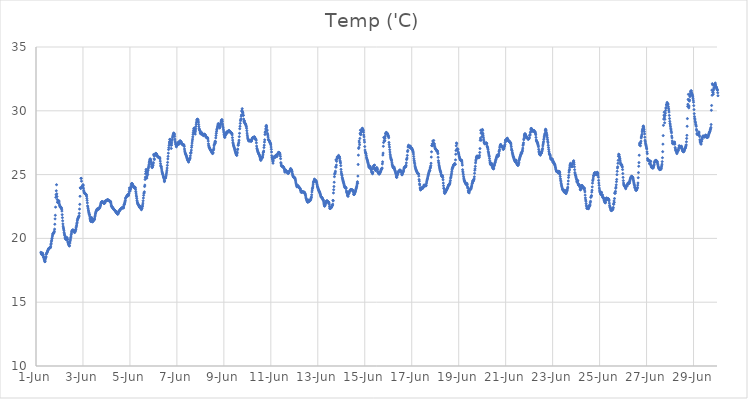
| Category | Temp ('C) |
|---|---|
| 44348.208333333336 | 18.914 |
| 44348.21875 | 18.857 |
| 44348.229166666664 | 18.812 |
| 44348.239583333336 | 18.775 |
| 44348.25 | 18.73 |
| 44348.260416666664 | 18.742 |
| 44348.270833333336 | 18.828 |
| 44348.28125 | 18.842 |
| 44348.291666666664 | 18.756 |
| 44348.302083333336 | 18.712 |
| 44348.3125 | 18.607 |
| 44348.322916666664 | 18.527 |
| 44348.333333333336 | 18.507 |
| 44348.34375 | 18.408 |
| 44348.354166666664 | 18.339 |
| 44348.364583333336 | 18.288 |
| 44348.375 | 18.174 |
| 44348.385416666664 | 18.178 |
| 44348.395833333336 | 18.319 |
| 44348.40625 | 18.461 |
| 44348.416666666664 | 18.495 |
| 44348.427083333336 | 18.569 |
| 44348.4375 | 18.751 |
| 44348.447916666664 | 18.816 |
| 44348.458333333336 | 18.848 |
| 44348.46875 | 18.884 |
| 44348.479166666664 | 18.934 |
| 44348.489583333336 | 18.974 |
| 44348.5 | 19.025 |
| 44348.510416666664 | 19.064 |
| 44348.520833333336 | 19.135 |
| 44348.53125 | 19.162 |
| 44348.541666666664 | 19.211 |
| 44348.552083333336 | 19.222 |
| 44348.5625 | 19.228 |
| 44348.572916666664 | 19.257 |
| 44348.583333333336 | 19.265 |
| 44348.59375 | 19.268 |
| 44348.604166666664 | 19.26 |
| 44348.614583333336 | 19.291 |
| 44348.625 | 19.383 |
| 44348.635416666664 | 19.526 |
| 44348.645833333336 | 19.617 |
| 44348.65625 | 19.76 |
| 44348.666666666664 | 19.853 |
| 44348.677083333336 | 19.973 |
| 44348.6875 | 20.032 |
| 44348.697916666664 | 20.175 |
| 44348.708333333336 | 20.274 |
| 44348.71875 | 20.362 |
| 44348.729166666664 | 20.379 |
| 44348.739583333336 | 20.404 |
| 44348.75 | 20.387 |
| 44348.760416666664 | 20.467 |
| 44348.770833333336 | 20.499 |
| 44348.78125 | 20.561 |
| 44348.791666666664 | 20.724 |
| 44348.802083333336 | 21.11 |
| 44348.8125 | 21.53 |
| 44348.822916666664 | 21.81 |
| 44348.833333333336 | 22.45 |
| 44348.84375 | 23.217 |
| 44348.854166666664 | 23.421 |
| 44348.864583333336 | 23.73 |
| 44348.875 | 24.207 |
| 44348.885416666664 | 23.493 |
| 44348.895833333336 | 23.282 |
| 44348.90625 | 23.049 |
| 44348.916666666664 | 22.842 |
| 44348.927083333336 | 22.81 |
| 44348.9375 | 22.842 |
| 44348.947916666664 | 22.965 |
| 44348.958333333336 | 22.901 |
| 44348.96875 | 22.956 |
| 44348.979166666664 | 22.909 |
| 44348.989583333336 | 22.767 |
| 44349.0 | 22.64 |
| 44349.010416666664 | 22.563 |
| 44349.020833333336 | 22.512 |
| 44349.03125 | 22.458 |
| 44349.041666666664 | 22.456 |
| 44349.052083333336 | 22.417 |
| 44349.0625 | 22.445 |
| 44349.072916666664 | 22.397 |
| 44349.083333333336 | 22.364 |
| 44349.09375 | 22.276 |
| 44349.104166666664 | 22.14 |
| 44349.114583333336 | 21.86 |
| 44349.125 | 21.625 |
| 44349.135416666664 | 21.379 |
| 44349.145833333336 | 21.136 |
| 44349.15625 | 20.956 |
| 44349.166666666664 | 20.826 |
| 44349.177083333336 | 20.735 |
| 44349.1875 | 20.634 |
| 44349.197916666664 | 20.474 |
| 44349.208333333336 | 20.361 |
| 44349.21875 | 20.265 |
| 44349.229166666664 | 20.213 |
| 44349.239583333336 | 20.091 |
| 44349.25 | 19.996 |
| 44349.260416666664 | 19.97 |
| 44349.270833333336 | 19.949 |
| 44349.28125 | 19.934 |
| 44349.291666666664 | 19.913 |
| 44349.302083333336 | 19.912 |
| 44349.3125 | 20.072 |
| 44349.322916666664 | 20.041 |
| 44349.333333333336 | 19.953 |
| 44349.34375 | 19.911 |
| 44349.354166666664 | 19.737 |
| 44349.364583333336 | 19.657 |
| 44349.375 | 19.634 |
| 44349.385416666664 | 19.499 |
| 44349.395833333336 | 19.56 |
| 44349.40625 | 19.66 |
| 44349.416666666664 | 19.405 |
| 44349.427083333336 | 19.429 |
| 44349.4375 | 19.612 |
| 44349.447916666664 | 19.724 |
| 44349.458333333336 | 19.83 |
| 44349.46875 | 19.947 |
| 44349.479166666664 | 20.072 |
| 44349.489583333336 | 20.18 |
| 44349.5 | 20.303 |
| 44349.510416666664 | 20.416 |
| 44349.520833333336 | 20.539 |
| 44349.53125 | 20.578 |
| 44349.541666666664 | 20.612 |
| 44349.552083333336 | 20.639 |
| 44349.5625 | 20.65 |
| 44349.572916666664 | 20.657 |
| 44349.583333333336 | 20.641 |
| 44349.59375 | 20.629 |
| 44349.604166666664 | 20.617 |
| 44349.614583333336 | 20.595 |
| 44349.625 | 20.545 |
| 44349.635416666664 | 20.486 |
| 44349.645833333336 | 20.458 |
| 44349.65625 | 20.502 |
| 44349.666666666664 | 20.534 |
| 44349.677083333336 | 20.589 |
| 44349.6875 | 20.667 |
| 44349.697916666664 | 20.721 |
| 44349.708333333336 | 20.835 |
| 44349.71875 | 20.934 |
| 44349.729166666664 | 21.031 |
| 44349.739583333336 | 21.151 |
| 44349.75 | 21.246 |
| 44349.760416666664 | 21.383 |
| 44349.770833333336 | 21.477 |
| 44349.78125 | 21.538 |
| 44349.791666666664 | 21.587 |
| 44349.802083333336 | 21.641 |
| 44349.8125 | 21.664 |
| 44349.822916666664 | 21.717 |
| 44349.833333333336 | 21.769 |
| 44349.84375 | 21.963 |
| 44349.854166666664 | 22.298 |
| 44349.864583333336 | 22.671 |
| 44349.875 | 23.301 |
| 44349.885416666664 | 23.962 |
| 44349.895833333336 | 23.961 |
| 44349.90625 | 23.913 |
| 44349.916666666664 | 24.708 |
| 44349.927083333336 | 24.707 |
| 44349.9375 | 24.484 |
| 44349.947916666664 | 23.98 |
| 44349.958333333336 | 24.076 |
| 44349.96875 | 24.02 |
| 44349.979166666664 | 24.098 |
| 44349.989583333336 | 24.077 |
| 44350.0 | 24.213 |
| 44350.010416666664 | 24.161 |
| 44350.020833333336 | 23.936 |
| 44350.03125 | 23.769 |
| 44350.041666666664 | 23.664 |
| 44350.052083333336 | 23.577 |
| 44350.0625 | 23.552 |
| 44350.072916666664 | 23.551 |
| 44350.083333333336 | 23.532 |
| 44350.09375 | 23.49 |
| 44350.104166666664 | 23.493 |
| 44350.114583333336 | 23.479 |
| 44350.125 | 23.452 |
| 44350.135416666664 | 23.439 |
| 44350.145833333336 | 23.396 |
| 44350.15625 | 23.298 |
| 44350.166666666664 | 23.138 |
| 44350.177083333336 | 22.979 |
| 44350.1875 | 22.784 |
| 44350.197916666664 | 22.551 |
| 44350.208333333336 | 22.465 |
| 44350.21875 | 22.351 |
| 44350.229166666664 | 22.223 |
| 44350.239583333336 | 22.137 |
| 44350.25 | 22.029 |
| 44350.260416666664 | 21.963 |
| 44350.270833333336 | 21.872 |
| 44350.28125 | 21.84 |
| 44350.291666666664 | 21.693 |
| 44350.302083333336 | 21.576 |
| 44350.3125 | 21.47 |
| 44350.322916666664 | 21.409 |
| 44350.333333333336 | 21.363 |
| 44350.34375 | 21.315 |
| 44350.354166666664 | 21.332 |
| 44350.364583333336 | 21.642 |
| 44350.375 | 21.569 |
| 44350.385416666664 | 21.501 |
| 44350.395833333336 | 21.434 |
| 44350.40625 | 21.295 |
| 44350.416666666664 | 21.333 |
| 44350.427083333336 | 21.433 |
| 44350.4375 | 21.362 |
| 44350.447916666664 | 21.452 |
| 44350.458333333336 | 21.464 |
| 44350.46875 | 21.453 |
| 44350.479166666664 | 21.453 |
| 44350.489583333336 | 21.493 |
| 44350.5 | 21.599 |
| 44350.510416666664 | 21.725 |
| 44350.520833333336 | 21.825 |
| 44350.53125 | 21.929 |
| 44350.541666666664 | 22.007 |
| 44350.552083333336 | 22.08 |
| 44350.5625 | 22.133 |
| 44350.572916666664 | 22.181 |
| 44350.583333333336 | 22.211 |
| 44350.59375 | 22.266 |
| 44350.604166666664 | 22.3 |
| 44350.614583333336 | 22.299 |
| 44350.625 | 22.316 |
| 44350.635416666664 | 22.315 |
| 44350.645833333336 | 22.298 |
| 44350.65625 | 22.278 |
| 44350.666666666664 | 22.321 |
| 44350.677083333336 | 22.31 |
| 44350.6875 | 22.353 |
| 44350.697916666664 | 22.388 |
| 44350.708333333336 | 22.408 |
| 44350.71875 | 22.44 |
| 44350.729166666664 | 22.502 |
| 44350.739583333336 | 22.557 |
| 44350.75 | 22.618 |
| 44350.760416666664 | 22.711 |
| 44350.770833333336 | 22.776 |
| 44350.78125 | 22.815 |
| 44350.791666666664 | 22.838 |
| 44350.802083333336 | 22.868 |
| 44350.8125 | 22.882 |
| 44350.822916666664 | 22.873 |
| 44350.833333333336 | 22.854 |
| 44350.84375 | 22.836 |
| 44350.854166666664 | 22.837 |
| 44350.864583333336 | 22.843 |
| 44350.875 | 22.775 |
| 44350.885416666664 | 22.778 |
| 44350.895833333336 | 22.745 |
| 44350.90625 | 22.738 |
| 44350.916666666664 | 22.779 |
| 44350.927083333336 | 22.759 |
| 44350.9375 | 22.916 |
| 44350.947916666664 | 22.902 |
| 44350.958333333336 | 22.915 |
| 44350.96875 | 22.889 |
| 44350.979166666664 | 22.948 |
| 44350.989583333336 | 22.958 |
| 44351.0 | 22.972 |
| 44351.010416666664 | 22.969 |
| 44351.020833333336 | 22.994 |
| 44351.03125 | 23.021 |
| 44351.041666666664 | 23.024 |
| 44351.052083333336 | 23.026 |
| 44351.0625 | 23.023 |
| 44351.072916666664 | 23.003 |
| 44351.083333333336 | 22.982 |
| 44351.09375 | 22.975 |
| 44351.104166666664 | 22.97 |
| 44351.114583333336 | 22.954 |
| 44351.125 | 22.938 |
| 44351.135416666664 | 22.928 |
| 44351.145833333336 | 22.872 |
| 44351.15625 | 22.885 |
| 44351.166666666664 | 22.906 |
| 44351.177083333336 | 22.879 |
| 44351.1875 | 22.783 |
| 44351.197916666664 | 22.694 |
| 44351.208333333336 | 22.592 |
| 44351.21875 | 22.52 |
| 44351.229166666664 | 22.481 |
| 44351.239583333336 | 22.456 |
| 44351.25 | 22.449 |
| 44351.260416666664 | 22.421 |
| 44351.270833333336 | 22.39 |
| 44351.28125 | 22.36 |
| 44351.291666666664 | 22.338 |
| 44351.302083333336 | 22.309 |
| 44351.3125 | 22.278 |
| 44351.322916666664 | 22.249 |
| 44351.333333333336 | 22.228 |
| 44351.34375 | 22.211 |
| 44351.354166666664 | 22.193 |
| 44351.364583333336 | 22.181 |
| 44351.375 | 22.166 |
| 44351.385416666664 | 22.149 |
| 44351.395833333336 | 22.099 |
| 44351.40625 | 22.044 |
| 44351.416666666664 | 22.018 |
| 44351.427083333336 | 22.104 |
| 44351.4375 | 21.997 |
| 44351.447916666664 | 22.013 |
| 44351.458333333336 | 21.929 |
| 44351.46875 | 21.913 |
| 44351.479166666664 | 21.911 |
| 44351.489583333336 | 21.9 |
| 44351.5 | 21.961 |
| 44351.510416666664 | 22.025 |
| 44351.520833333336 | 22.054 |
| 44351.53125 | 22.13 |
| 44351.541666666664 | 22.135 |
| 44351.552083333336 | 22.167 |
| 44351.5625 | 22.196 |
| 44351.572916666664 | 22.222 |
| 44351.583333333336 | 22.247 |
| 44351.59375 | 22.272 |
| 44351.604166666664 | 22.293 |
| 44351.614583333336 | 22.313 |
| 44351.625 | 22.321 |
| 44351.635416666664 | 22.354 |
| 44351.645833333336 | 22.359 |
| 44351.65625 | 22.379 |
| 44351.666666666664 | 22.404 |
| 44351.677083333336 | 22.403 |
| 44351.6875 | 22.391 |
| 44351.697916666664 | 22.411 |
| 44351.708333333336 | 22.419 |
| 44351.71875 | 22.421 |
| 44351.729166666664 | 22.38 |
| 44351.739583333336 | 22.543 |
| 44351.75 | 22.629 |
| 44351.760416666664 | 22.66 |
| 44351.770833333336 | 22.713 |
| 44351.78125 | 22.799 |
| 44351.791666666664 | 22.883 |
| 44351.802083333336 | 22.977 |
| 44351.8125 | 23.117 |
| 44351.822916666664 | 23.176 |
| 44351.833333333336 | 23.216 |
| 44351.84375 | 23.241 |
| 44351.854166666664 | 23.277 |
| 44351.864583333336 | 23.3 |
| 44351.875 | 23.316 |
| 44351.885416666664 | 23.366 |
| 44351.895833333336 | 23.411 |
| 44351.90625 | 23.432 |
| 44351.916666666664 | 23.408 |
| 44351.927083333336 | 23.421 |
| 44351.9375 | 23.352 |
| 44351.947916666664 | 23.399 |
| 44351.958333333336 | 23.525 |
| 44351.96875 | 23.669 |
| 44351.979166666664 | 23.959 |
| 44351.989583333336 | 23.835 |
| 44352.0 | 23.795 |
| 44352.010416666664 | 23.716 |
| 44352.020833333336 | 23.878 |
| 44352.03125 | 23.895 |
| 44352.041666666664 | 23.996 |
| 44352.052083333336 | 24.111 |
| 44352.0625 | 24.233 |
| 44352.072916666664 | 24.298 |
| 44352.083333333336 | 24.309 |
| 44352.09375 | 24.281 |
| 44352.104166666664 | 24.257 |
| 44352.114583333336 | 24.187 |
| 44352.125 | 24.181 |
| 44352.135416666664 | 24.126 |
| 44352.145833333336 | 24.081 |
| 44352.15625 | 24.032 |
| 44352.166666666664 | 24.012 |
| 44352.177083333336 | 24.027 |
| 44352.1875 | 23.97 |
| 44352.197916666664 | 23.997 |
| 44352.208333333336 | 24.019 |
| 44352.21875 | 24.004 |
| 44352.229166666664 | 23.956 |
| 44352.239583333336 | 23.841 |
| 44352.25 | 23.679 |
| 44352.260416666664 | 23.547 |
| 44352.270833333336 | 23.393 |
| 44352.28125 | 23.267 |
| 44352.291666666664 | 23.129 |
| 44352.302083333336 | 22.968 |
| 44352.3125 | 22.859 |
| 44352.322916666664 | 22.787 |
| 44352.333333333336 | 22.724 |
| 44352.34375 | 22.68 |
| 44352.354166666664 | 22.659 |
| 44352.364583333336 | 22.634 |
| 44352.375 | 22.592 |
| 44352.385416666664 | 22.542 |
| 44352.395833333336 | 22.489 |
| 44352.40625 | 22.456 |
| 44352.416666666664 | 22.431 |
| 44352.427083333336 | 22.415 |
| 44352.4375 | 22.481 |
| 44352.447916666664 | 22.505 |
| 44352.458333333336 | 22.443 |
| 44352.46875 | 22.404 |
| 44352.479166666664 | 22.291 |
| 44352.489583333336 | 22.246 |
| 44352.5 | 22.324 |
| 44352.510416666664 | 22.338 |
| 44352.520833333336 | 22.477 |
| 44352.53125 | 22.499 |
| 44352.541666666664 | 22.622 |
| 44352.552083333336 | 22.766 |
| 44352.5625 | 22.949 |
| 44352.572916666664 | 23.167 |
| 44352.583333333336 | 23.371 |
| 44352.59375 | 23.545 |
| 44352.604166666664 | 23.56 |
| 44352.614583333336 | 23.652 |
| 44352.625 | 24.066 |
| 44352.635416666664 | 24.178 |
| 44352.645833333336 | 24.621 |
| 44352.65625 | 24.797 |
| 44352.666666666664 | 25.065 |
| 44352.677083333336 | 25.246 |
| 44352.6875 | 25.405 |
| 44352.697916666664 | 25.207 |
| 44352.708333333336 | 24.795 |
| 44352.71875 | 24.719 |
| 44352.729166666664 | 24.89 |
| 44352.739583333336 | 25.048 |
| 44352.75 | 25.191 |
| 44352.760416666664 | 25.008 |
| 44352.770833333336 | 25.321 |
| 44352.78125 | 25.462 |
| 44352.791666666664 | 25.575 |
| 44352.802083333336 | 25.678 |
| 44352.8125 | 25.809 |
| 44352.822916666664 | 25.969 |
| 44352.833333333336 | 26.038 |
| 44352.84375 | 26.139 |
| 44352.854166666664 | 26.215 |
| 44352.864583333336 | 26.222 |
| 44352.875 | 26.193 |
| 44352.885416666664 | 26.122 |
| 44352.895833333336 | 26.019 |
| 44352.90625 | 25.901 |
| 44352.916666666664 | 25.777 |
| 44352.927083333336 | 25.64 |
| 44352.9375 | 25.595 |
| 44352.947916666664 | 25.546 |
| 44352.958333333336 | 25.592 |
| 44352.96875 | 25.723 |
| 44352.979166666664 | 25.704 |
| 44352.989583333336 | 25.842 |
| 44353.0 | 25.94 |
| 44353.010416666664 | 26.578 |
| 44353.020833333336 | 26.484 |
| 44353.03125 | 26.247 |
| 44353.041666666664 | 26.177 |
| 44353.052083333336 | 26.465 |
| 44353.0625 | 26.579 |
| 44353.072916666664 | 26.57 |
| 44353.083333333336 | 26.585 |
| 44353.09375 | 26.662 |
| 44353.104166666664 | 26.647 |
| 44353.114583333336 | 26.648 |
| 44353.125 | 26.625 |
| 44353.135416666664 | 26.595 |
| 44353.145833333336 | 26.549 |
| 44353.15625 | 26.496 |
| 44353.166666666664 | 26.441 |
| 44353.177083333336 | 26.407 |
| 44353.1875 | 26.402 |
| 44353.197916666664 | 26.394 |
| 44353.208333333336 | 26.372 |
| 44353.21875 | 26.344 |
| 44353.229166666664 | 26.352 |
| 44353.239583333336 | 26.352 |
| 44353.25 | 26.354 |
| 44353.260416666664 | 26.339 |
| 44353.270833333336 | 26.312 |
| 44353.28125 | 26.229 |
| 44353.291666666664 | 26.057 |
| 44353.302083333336 | 25.863 |
| 44353.3125 | 25.718 |
| 44353.322916666664 | 25.629 |
| 44353.333333333336 | 25.615 |
| 44353.34375 | 25.506 |
| 44353.354166666664 | 25.367 |
| 44353.364583333336 | 25.264 |
| 44353.375 | 25.18 |
| 44353.385416666664 | 25.095 |
| 44353.395833333336 | 25.027 |
| 44353.40625 | 24.976 |
| 44353.416666666664 | 24.893 |
| 44353.427083333336 | 24.818 |
| 44353.4375 | 24.768 |
| 44353.447916666664 | 24.702 |
| 44353.458333333336 | 24.578 |
| 44353.46875 | 24.448 |
| 44353.479166666664 | 24.509 |
| 44353.489583333336 | 24.748 |
| 44353.5 | 24.731 |
| 44353.510416666664 | 24.761 |
| 44353.520833333336 | 24.727 |
| 44353.53125 | 24.823 |
| 44353.541666666664 | 24.952 |
| 44353.552083333336 | 25.06 |
| 44353.5625 | 25.201 |
| 44353.572916666664 | 25.343 |
| 44353.583333333336 | 25.514 |
| 44353.59375 | 25.726 |
| 44353.604166666664 | 25.956 |
| 44353.614583333336 | 26.227 |
| 44353.625 | 26.429 |
| 44353.635416666664 | 26.68 |
| 44353.645833333336 | 26.963 |
| 44353.65625 | 27.117 |
| 44353.666666666664 | 27.298 |
| 44353.677083333336 | 27.472 |
| 44353.6875 | 27.579 |
| 44353.697916666664 | 27.764 |
| 44353.708333333336 | 27.756 |
| 44353.71875 | 27.704 |
| 44353.729166666664 | 27.524 |
| 44353.739583333336 | 27.38 |
| 44353.75 | 27.297 |
| 44353.760416666664 | 27.051 |
| 44353.770833333336 | 27.309 |
| 44353.78125 | 27.481 |
| 44353.791666666664 | 27.663 |
| 44353.802083333336 | 27.739 |
| 44353.8125 | 27.885 |
| 44353.822916666664 | 27.993 |
| 44353.833333333336 | 28.047 |
| 44353.84375 | 28.153 |
| 44353.854166666664 | 28.216 |
| 44353.864583333336 | 28.257 |
| 44353.875 | 28.246 |
| 44353.885416666664 | 28.211 |
| 44353.895833333336 | 28.13 |
| 44353.90625 | 27.993 |
| 44353.916666666664 | 27.781 |
| 44353.927083333336 | 27.62 |
| 44353.9375 | 27.504 |
| 44353.947916666664 | 27.393 |
| 44353.958333333336 | 27.348 |
| 44353.96875 | 27.242 |
| 44353.979166666664 | 27.172 |
| 44353.989583333336 | 27.308 |
| 44354.0 | 27.375 |
| 44354.010416666664 | 27.297 |
| 44354.020833333336 | 27.327 |
| 44354.03125 | 27.34 |
| 44354.041666666664 | 27.441 |
| 44354.052083333336 | 27.437 |
| 44354.0625 | 27.523 |
| 44354.072916666664 | 27.551 |
| 44354.083333333336 | 27.482 |
| 44354.09375 | 27.391 |
| 44354.104166666664 | 27.429 |
| 44354.114583333336 | 27.51 |
| 44354.125 | 27.606 |
| 44354.135416666664 | 27.657 |
| 44354.145833333336 | 27.626 |
| 44354.15625 | 27.582 |
| 44354.166666666664 | 27.589 |
| 44354.177083333336 | 27.583 |
| 44354.1875 | 27.513 |
| 44354.197916666664 | 27.47 |
| 44354.208333333336 | 27.415 |
| 44354.21875 | 27.394 |
| 44354.229166666664 | 27.378 |
| 44354.239583333336 | 27.371 |
| 44354.25 | 27.334 |
| 44354.260416666664 | 27.334 |
| 44354.270833333336 | 27.35 |
| 44354.28125 | 27.351 |
| 44354.291666666664 | 27.341 |
| 44354.302083333336 | 27.27 |
| 44354.3125 | 27.202 |
| 44354.322916666664 | 27.005 |
| 44354.333333333336 | 26.855 |
| 44354.34375 | 26.77 |
| 44354.354166666664 | 26.694 |
| 44354.364583333336 | 26.638 |
| 44354.375 | 26.61 |
| 44354.385416666664 | 26.559 |
| 44354.395833333336 | 26.498 |
| 44354.40625 | 26.445 |
| 44354.416666666664 | 26.381 |
| 44354.427083333336 | 26.315 |
| 44354.4375 | 26.262 |
| 44354.447916666664 | 26.196 |
| 44354.458333333336 | 26.146 |
| 44354.46875 | 26.103 |
| 44354.479166666664 | 26.098 |
| 44354.489583333336 | 26.029 |
| 44354.5 | 25.976 |
| 44354.510416666664 | 26.132 |
| 44354.520833333336 | 26.187 |
| 44354.53125 | 26.235 |
| 44354.541666666664 | 26.167 |
| 44354.552083333336 | 26.251 |
| 44354.5625 | 26.313 |
| 44354.572916666664 | 26.472 |
| 44354.583333333336 | 26.699 |
| 44354.59375 | 26.667 |
| 44354.604166666664 | 26.752 |
| 44354.614583333336 | 26.919 |
| 44354.625 | 27.135 |
| 44354.635416666664 | 27.283 |
| 44354.645833333336 | 27.472 |
| 44354.65625 | 27.635 |
| 44354.666666666664 | 27.781 |
| 44354.677083333336 | 27.956 |
| 44354.6875 | 28.15 |
| 44354.697916666664 | 28.3 |
| 44354.708333333336 | 28.442 |
| 44354.71875 | 28.578 |
| 44354.729166666664 | 28.602 |
| 44354.739583333336 | 28.659 |
| 44354.75 | 28.481 |
| 44354.760416666664 | 28.468 |
| 44354.770833333336 | 28.292 |
| 44354.78125 | 28.171 |
| 44354.791666666664 | 28.412 |
| 44354.802083333336 | 28.587 |
| 44354.8125 | 28.775 |
| 44354.822916666664 | 28.945 |
| 44354.833333333336 | 29.085 |
| 44354.84375 | 29.2 |
| 44354.854166666664 | 29.295 |
| 44354.864583333336 | 29.33 |
| 44354.875 | 29.341 |
| 44354.885416666664 | 29.317 |
| 44354.895833333336 | 29.296 |
| 44354.90625 | 29.207 |
| 44354.916666666664 | 29.11 |
| 44354.927083333336 | 28.932 |
| 44354.9375 | 28.766 |
| 44354.947916666664 | 28.613 |
| 44354.958333333336 | 28.531 |
| 44354.96875 | 28.477 |
| 44354.979166666664 | 28.437 |
| 44354.989583333336 | 28.331 |
| 44355.0 | 28.241 |
| 44355.010416666664 | 28.215 |
| 44355.020833333336 | 28.218 |
| 44355.03125 | 28.177 |
| 44355.041666666664 | 28.32 |
| 44355.052083333336 | 28.263 |
| 44355.0625 | 28.206 |
| 44355.072916666664 | 28.141 |
| 44355.083333333336 | 28.208 |
| 44355.09375 | 28.198 |
| 44355.104166666664 | 28.151 |
| 44355.114583333336 | 28.111 |
| 44355.125 | 28.053 |
| 44355.135416666664 | 28.098 |
| 44355.145833333336 | 28.103 |
| 44355.15625 | 28.172 |
| 44355.166666666664 | 28.167 |
| 44355.177083333336 | 28.138 |
| 44355.1875 | 28.134 |
| 44355.197916666664 | 28.122 |
| 44355.208333333336 | 28.106 |
| 44355.21875 | 28.048 |
| 44355.229166666664 | 28.02 |
| 44355.239583333336 | 27.955 |
| 44355.25 | 27.92 |
| 44355.260416666664 | 27.934 |
| 44355.270833333336 | 27.891 |
| 44355.28125 | 27.891 |
| 44355.291666666664 | 27.904 |
| 44355.302083333336 | 27.897 |
| 44355.3125 | 27.87 |
| 44355.322916666664 | 27.79 |
| 44355.333333333336 | 27.626 |
| 44355.34375 | 27.415 |
| 44355.354166666664 | 27.288 |
| 44355.364583333336 | 27.216 |
| 44355.375 | 27.129 |
| 44355.385416666664 | 27.109 |
| 44355.395833333336 | 27.074 |
| 44355.40625 | 27.014 |
| 44355.416666666664 | 26.975 |
| 44355.427083333336 | 26.93 |
| 44355.4375 | 26.911 |
| 44355.447916666664 | 26.884 |
| 44355.458333333336 | 26.857 |
| 44355.46875 | 26.815 |
| 44355.479166666664 | 26.785 |
| 44355.489583333336 | 26.742 |
| 44355.5 | 26.701 |
| 44355.510416666664 | 26.675 |
| 44355.520833333336 | 26.647 |
| 44355.53125 | 26.687 |
| 44355.541666666664 | 26.719 |
| 44355.552083333336 | 26.906 |
| 44355.5625 | 26.968 |
| 44355.572916666664 | 27.08 |
| 44355.583333333336 | 27.254 |
| 44355.59375 | 27.358 |
| 44355.604166666664 | 27.388 |
| 44355.614583333336 | 27.495 |
| 44355.625 | 27.611 |
| 44355.635416666664 | 27.465 |
| 44355.645833333336 | 27.583 |
| 44355.65625 | 27.874 |
| 44355.666666666664 | 28.059 |
| 44355.677083333336 | 28.229 |
| 44355.6875 | 28.37 |
| 44355.697916666664 | 28.506 |
| 44355.708333333336 | 28.574 |
| 44355.71875 | 28.64 |
| 44355.729166666664 | 28.739 |
| 44355.739583333336 | 28.819 |
| 44355.75 | 28.911 |
| 44355.760416666664 | 28.994 |
| 44355.770833333336 | 28.973 |
| 44355.78125 | 28.938 |
| 44355.791666666664 | 28.889 |
| 44355.802083333336 | 28.75 |
| 44355.8125 | 28.725 |
| 44355.822916666664 | 28.649 |
| 44355.833333333336 | 28.723 |
| 44355.84375 | 28.802 |
| 44355.854166666664 | 28.885 |
| 44355.864583333336 | 28.985 |
| 44355.875 | 29.105 |
| 44355.885416666664 | 29.193 |
| 44355.895833333336 | 29.246 |
| 44355.90625 | 29.285 |
| 44355.916666666664 | 29.302 |
| 44355.927083333336 | 29.274 |
| 44355.9375 | 29.152 |
| 44355.947916666664 | 28.962 |
| 44355.958333333336 | 28.802 |
| 44355.96875 | 28.678 |
| 44355.979166666664 | 28.551 |
| 44355.989583333336 | 28.419 |
| 44356.0 | 28.286 |
| 44356.010416666664 | 28.149 |
| 44356.020833333336 | 28.042 |
| 44356.03125 | 27.943 |
| 44356.041666666664 | 27.912 |
| 44356.052083333336 | 28.161 |
| 44356.0625 | 28.047 |
| 44356.072916666664 | 28.098 |
| 44356.083333333336 | 28.159 |
| 44356.09375 | 28.206 |
| 44356.104166666664 | 28.254 |
| 44356.114583333336 | 28.316 |
| 44356.125 | 28.343 |
| 44356.135416666664 | 28.259 |
| 44356.145833333336 | 28.271 |
| 44356.15625 | 28.341 |
| 44356.166666666664 | 28.365 |
| 44356.177083333336 | 28.406 |
| 44356.1875 | 28.408 |
| 44356.197916666664 | 28.421 |
| 44356.208333333336 | 28.405 |
| 44356.21875 | 28.441 |
| 44356.229166666664 | 28.439 |
| 44356.239583333336 | 28.424 |
| 44356.25 | 28.398 |
| 44356.260416666664 | 28.387 |
| 44356.270833333336 | 28.328 |
| 44356.28125 | 28.335 |
| 44356.291666666664 | 28.327 |
| 44356.302083333336 | 28.261 |
| 44356.3125 | 28.247 |
| 44356.322916666664 | 28.258 |
| 44356.333333333336 | 28.243 |
| 44356.34375 | 28.207 |
| 44356.354166666664 | 28.107 |
| 44356.364583333336 | 27.898 |
| 44356.375 | 27.7 |
| 44356.385416666664 | 27.526 |
| 44356.395833333336 | 27.42 |
| 44356.40625 | 27.324 |
| 44356.416666666664 | 27.251 |
| 44356.427083333336 | 27.225 |
| 44356.4375 | 27.139 |
| 44356.447916666664 | 27.079 |
| 44356.458333333336 | 27 |
| 44356.46875 | 26.927 |
| 44356.479166666664 | 26.863 |
| 44356.489583333336 | 26.803 |
| 44356.5 | 26.734 |
| 44356.510416666664 | 26.673 |
| 44356.520833333336 | 26.612 |
| 44356.53125 | 26.556 |
| 44356.541666666664 | 26.543 |
| 44356.552083333336 | 26.503 |
| 44356.5625 | 26.637 |
| 44356.572916666664 | 26.753 |
| 44356.583333333336 | 26.959 |
| 44356.59375 | 27.004 |
| 44356.604166666664 | 27.315 |
| 44356.614583333336 | 27.296 |
| 44356.625 | 27.429 |
| 44356.635416666664 | 27.54 |
| 44356.645833333336 | 27.693 |
| 44356.65625 | 27.973 |
| 44356.666666666664 | 28.235 |
| 44356.677083333336 | 28.592 |
| 44356.6875 | 28.784 |
| 44356.697916666664 | 29.011 |
| 44356.708333333336 | 29.224 |
| 44356.71875 | 29.307 |
| 44356.729166666664 | 29.369 |
| 44356.739583333336 | 29.569 |
| 44356.75 | 29.678 |
| 44356.760416666664 | 29.961 |
| 44356.770833333336 | 30.038 |
| 44356.78125 | 30.167 |
| 44356.791666666664 | 29.933 |
| 44356.802083333336 | 29.884 |
| 44356.8125 | 29.82 |
| 44356.822916666664 | 29.652 |
| 44356.833333333336 | 29.641 |
| 44356.84375 | 29.353 |
| 44356.854166666664 | 29.138 |
| 44356.864583333336 | 29.239 |
| 44356.875 | 29.197 |
| 44356.885416666664 | 29.076 |
| 44356.895833333336 | 29.029 |
| 44356.90625 | 28.989 |
| 44356.916666666664 | 28.977 |
| 44356.927083333336 | 28.932 |
| 44356.9375 | 28.877 |
| 44356.947916666664 | 28.813 |
| 44356.958333333336 | 28.748 |
| 44356.96875 | 28.621 |
| 44356.979166666664 | 28.44 |
| 44356.989583333336 | 28.246 |
| 44357.0 | 28.088 |
| 44357.010416666664 | 27.946 |
| 44357.020833333336 | 27.83 |
| 44357.03125 | 27.769 |
| 44357.041666666664 | 27.706 |
| 44357.052083333336 | 27.673 |
| 44357.0625 | 27.627 |
| 44357.072916666664 | 27.654 |
| 44357.083333333336 | 27.647 |
| 44357.09375 | 27.672 |
| 44357.104166666664 | 27.676 |
| 44357.114583333336 | 27.621 |
| 44357.125 | 27.671 |
| 44357.135416666664 | 27.638 |
| 44357.145833333336 | 27.678 |
| 44357.15625 | 27.667 |
| 44357.166666666664 | 27.609 |
| 44357.177083333336 | 27.632 |
| 44357.1875 | 27.718 |
| 44357.197916666664 | 27.789 |
| 44357.208333333336 | 27.844 |
| 44357.21875 | 27.887 |
| 44357.229166666664 | 27.841 |
| 44357.239583333336 | 27.91 |
| 44357.25 | 27.926 |
| 44357.260416666664 | 27.913 |
| 44357.270833333336 | 27.879 |
| 44357.28125 | 27.904 |
| 44357.291666666664 | 27.955 |
| 44357.302083333336 | 27.949 |
| 44357.3125 | 27.933 |
| 44357.322916666664 | 27.846 |
| 44357.333333333336 | 27.818 |
| 44357.34375 | 27.824 |
| 44357.354166666664 | 27.8 |
| 44357.364583333336 | 27.762 |
| 44357.375 | 27.682 |
| 44357.385416666664 | 27.487 |
| 44357.395833333336 | 27.235 |
| 44357.40625 | 27.063 |
| 44357.416666666664 | 27.001 |
| 44357.427083333336 | 26.93 |
| 44357.4375 | 26.856 |
| 44357.447916666664 | 26.79 |
| 44357.458333333336 | 26.734 |
| 44357.46875 | 26.692 |
| 44357.479166666664 | 26.651 |
| 44357.489583333336 | 26.609 |
| 44357.5 | 26.575 |
| 44357.510416666664 | 26.534 |
| 44357.520833333336 | 26.482 |
| 44357.53125 | 26.411 |
| 44357.541666666664 | 26.314 |
| 44357.552083333336 | 26.214 |
| 44357.5625 | 26.195 |
| 44357.572916666664 | 26.11 |
| 44357.583333333336 | 26.163 |
| 44357.59375 | 26.227 |
| 44357.604166666664 | 26.316 |
| 44357.614583333336 | 26.332 |
| 44357.625 | 26.29 |
| 44357.635416666664 | 26.331 |
| 44357.645833333336 | 26.363 |
| 44357.65625 | 26.47 |
| 44357.666666666664 | 26.598 |
| 44357.677083333336 | 26.736 |
| 44357.6875 | 26.773 |
| 44357.697916666664 | 26.851 |
| 44357.708333333336 | 27.121 |
| 44357.71875 | 27.307 |
| 44357.729166666664 | 27.55 |
| 44357.739583333336 | 27.724 |
| 44357.75 | 28.144 |
| 44357.760416666664 | 28.313 |
| 44357.770833333336 | 28.378 |
| 44357.78125 | 28.579 |
| 44357.791666666664 | 28.772 |
| 44357.802083333336 | 28.813 |
| 44357.8125 | 28.853 |
| 44357.822916666664 | 28.717 |
| 44357.833333333336 | 28.535 |
| 44357.84375 | 28.443 |
| 44357.854166666664 | 28.24 |
| 44357.864583333336 | 28.155 |
| 44357.875 | 28.041 |
| 44357.885416666664 | 27.932 |
| 44357.895833333336 | 27.768 |
| 44357.90625 | 27.726 |
| 44357.916666666664 | 27.681 |
| 44357.927083333336 | 27.667 |
| 44357.9375 | 27.642 |
| 44357.947916666664 | 27.588 |
| 44357.958333333336 | 27.538 |
| 44357.96875 | 27.499 |
| 44357.979166666664 | 27.451 |
| 44357.989583333336 | 27.405 |
| 44358.0 | 27.325 |
| 44358.010416666664 | 27.159 |
| 44358.020833333336 | 26.983 |
| 44358.03125 | 26.772 |
| 44358.041666666664 | 26.483 |
| 44358.052083333336 | 26.34 |
| 44358.0625 | 26.225 |
| 44358.072916666664 | 26.154 |
| 44358.083333333336 | 26.014 |
| 44358.09375 | 25.892 |
| 44358.104166666664 | 26.083 |
| 44358.114583333336 | 26.282 |
| 44358.125 | 26.38 |
| 44358.135416666664 | 26.321 |
| 44358.145833333336 | 26.328 |
| 44358.15625 | 26.303 |
| 44358.166666666664 | 26.407 |
| 44358.177083333336 | 26.398 |
| 44358.1875 | 26.388 |
| 44358.197916666664 | 26.476 |
| 44358.208333333336 | 26.475 |
| 44358.21875 | 26.523 |
| 44358.229166666664 | 26.521 |
| 44358.239583333336 | 26.491 |
| 44358.25 | 26.408 |
| 44358.260416666664 | 26.427 |
| 44358.270833333336 | 26.544 |
| 44358.28125 | 26.537 |
| 44358.291666666664 | 26.613 |
| 44358.302083333336 | 26.655 |
| 44358.3125 | 26.678 |
| 44358.322916666664 | 26.742 |
| 44358.333333333336 | 26.726 |
| 44358.34375 | 26.737 |
| 44358.354166666664 | 26.716 |
| 44358.364583333336 | 26.657 |
| 44358.375 | 26.694 |
| 44358.385416666664 | 26.68 |
| 44358.395833333336 | 26.552 |
| 44358.40625 | 26.428 |
| 44358.416666666664 | 26.246 |
| 44358.427083333336 | 25.94 |
| 44358.4375 | 25.841 |
| 44358.447916666664 | 25.732 |
| 44358.458333333336 | 25.688 |
| 44358.46875 | 25.665 |
| 44358.479166666664 | 25.645 |
| 44358.489583333336 | 25.637 |
| 44358.5 | 25.641 |
| 44358.510416666664 | 25.64 |
| 44358.520833333336 | 25.624 |
| 44358.53125 | 25.595 |
| 44358.541666666664 | 25.561 |
| 44358.552083333336 | 25.528 |
| 44358.5625 | 25.493 |
| 44358.572916666664 | 25.448 |
| 44358.583333333336 | 25.351 |
| 44358.59375 | 25.226 |
| 44358.604166666664 | 25.187 |
| 44358.614583333336 | 25.292 |
| 44358.625 | 25.339 |
| 44358.635416666664 | 25.355 |
| 44358.645833333336 | 25.312 |
| 44358.65625 | 25.275 |
| 44358.666666666664 | 25.244 |
| 44358.677083333336 | 25.239 |
| 44358.6875 | 25.222 |
| 44358.697916666664 | 25.163 |
| 44358.708333333336 | 25.182 |
| 44358.71875 | 25.164 |
| 44358.729166666664 | 25.109 |
| 44358.739583333336 | 25.087 |
| 44358.75 | 25.11 |
| 44358.760416666664 | 25.139 |
| 44358.770833333336 | 25.182 |
| 44358.78125 | 25.217 |
| 44358.791666666664 | 25.261 |
| 44358.802083333336 | 25.303 |
| 44358.8125 | 25.326 |
| 44358.822916666664 | 25.358 |
| 44358.833333333336 | 25.422 |
| 44358.84375 | 25.478 |
| 44358.854166666664 | 25.397 |
| 44358.864583333336 | 25.381 |
| 44358.875 | 25.395 |
| 44358.885416666664 | 25.36 |
| 44358.895833333336 | 25.286 |
| 44358.90625 | 25.224 |
| 44358.916666666664 | 25.105 |
| 44358.927083333336 | 24.994 |
| 44358.9375 | 24.922 |
| 44358.947916666664 | 24.882 |
| 44358.958333333336 | 24.834 |
| 44358.96875 | 24.792 |
| 44358.979166666664 | 24.786 |
| 44358.989583333336 | 24.783 |
| 44359.0 | 24.779 |
| 44359.010416666664 | 24.767 |
| 44359.020833333336 | 24.745 |
| 44359.03125 | 24.692 |
| 44359.041666666664 | 24.631 |
| 44359.052083333336 | 24.532 |
| 44359.0625 | 24.42 |
| 44359.072916666664 | 24.326 |
| 44359.083333333336 | 24.25 |
| 44359.09375 | 24.174 |
| 44359.104166666664 | 24.095 |
| 44359.114583333336 | 24.032 |
| 44359.125 | 24.109 |
| 44359.135416666664 | 24.068 |
| 44359.145833333336 | 24.155 |
| 44359.15625 | 24.109 |
| 44359.166666666664 | 24.089 |
| 44359.177083333336 | 24.035 |
| 44359.1875 | 24.032 |
| 44359.197916666664 | 24.027 |
| 44359.208333333336 | 24.001 |
| 44359.21875 | 23.948 |
| 44359.229166666664 | 23.933 |
| 44359.239583333336 | 23.918 |
| 44359.25 | 23.917 |
| 44359.260416666664 | 23.809 |
| 44359.270833333336 | 23.758 |
| 44359.28125 | 23.671 |
| 44359.291666666664 | 23.612 |
| 44359.302083333336 | 23.643 |
| 44359.3125 | 23.613 |
| 44359.322916666664 | 23.682 |
| 44359.333333333336 | 23.675 |
| 44359.34375 | 23.659 |
| 44359.354166666664 | 23.633 |
| 44359.364583333336 | 23.65 |
| 44359.375 | 23.631 |
| 44359.385416666664 | 23.631 |
| 44359.395833333336 | 23.632 |
| 44359.40625 | 23.595 |
| 44359.416666666664 | 23.611 |
| 44359.427083333336 | 23.624 |
| 44359.4375 | 23.596 |
| 44359.447916666664 | 23.54 |
| 44359.458333333336 | 23.511 |
| 44359.46875 | 23.442 |
| 44359.479166666664 | 23.362 |
| 44359.489583333336 | 23.245 |
| 44359.5 | 23.163 |
| 44359.510416666664 | 23.113 |
| 44359.520833333336 | 23.046 |
| 44359.53125 | 22.997 |
| 44359.541666666664 | 22.94 |
| 44359.552083333336 | 22.901 |
| 44359.5625 | 22.862 |
| 44359.572916666664 | 22.842 |
| 44359.583333333336 | 22.838 |
| 44359.59375 | 22.994 |
| 44359.604166666664 | 22.988 |
| 44359.614583333336 | 22.953 |
| 44359.625 | 22.91 |
| 44359.635416666664 | 22.915 |
| 44359.645833333336 | 22.927 |
| 44359.65625 | 22.94 |
| 44359.666666666664 | 22.948 |
| 44359.677083333336 | 22.977 |
| 44359.6875 | 23.028 |
| 44359.697916666664 | 23.073 |
| 44359.708333333336 | 23.104 |
| 44359.71875 | 23.187 |
| 44359.729166666664 | 23.25 |
| 44359.739583333336 | 23.416 |
| 44359.75 | 23.635 |
| 44359.760416666664 | 23.78 |
| 44359.770833333336 | 23.905 |
| 44359.78125 | 23.972 |
| 44359.791666666664 | 24.103 |
| 44359.802083333336 | 24.256 |
| 44359.8125 | 24.403 |
| 44359.822916666664 | 24.438 |
| 44359.833333333336 | 24.478 |
| 44359.84375 | 24.557 |
| 44359.854166666664 | 24.65 |
| 44359.864583333336 | 24.605 |
| 44359.875 | 24.59 |
| 44359.885416666664 | 24.563 |
| 44359.895833333336 | 24.507 |
| 44359.90625 | 24.52 |
| 44359.916666666664 | 24.536 |
| 44359.927083333336 | 24.509 |
| 44359.9375 | 24.443 |
| 44359.947916666664 | 24.39 |
| 44359.958333333336 | 24.333 |
| 44359.96875 | 24.222 |
| 44359.979166666664 | 24.112 |
| 44359.989583333336 | 24.05 |
| 44360.0 | 23.985 |
| 44360.010416666664 | 23.918 |
| 44360.020833333336 | 23.855 |
| 44360.03125 | 23.809 |
| 44360.041666666664 | 23.756 |
| 44360.052083333336 | 23.715 |
| 44360.0625 | 23.677 |
| 44360.072916666664 | 23.641 |
| 44360.083333333336 | 23.582 |
| 44360.09375 | 23.529 |
| 44360.104166666664 | 23.47 |
| 44360.114583333336 | 23.406 |
| 44360.125 | 23.326 |
| 44360.135416666664 | 23.252 |
| 44360.145833333336 | 23.248 |
| 44360.15625 | 23.223 |
| 44360.166666666664 | 23.22 |
| 44360.177083333336 | 23.207 |
| 44360.1875 | 23.153 |
| 44360.197916666664 | 23.125 |
| 44360.208333333336 | 23.095 |
| 44360.21875 | 23.035 |
| 44360.229166666664 | 23.007 |
| 44360.239583333336 | 22.977 |
| 44360.25 | 22.86 |
| 44360.260416666664 | 22.756 |
| 44360.270833333336 | 22.647 |
| 44360.28125 | 22.562 |
| 44360.291666666664 | 22.521 |
| 44360.302083333336 | 22.571 |
| 44360.3125 | 22.747 |
| 44360.322916666664 | 22.638 |
| 44360.333333333336 | 22.788 |
| 44360.34375 | 22.787 |
| 44360.354166666664 | 22.859 |
| 44360.364583333336 | 22.914 |
| 44360.375 | 22.925 |
| 44360.385416666664 | 22.937 |
| 44360.395833333336 | 22.936 |
| 44360.40625 | 22.922 |
| 44360.416666666664 | 22.918 |
| 44360.427083333336 | 22.858 |
| 44360.4375 | 22.829 |
| 44360.447916666664 | 22.833 |
| 44360.458333333336 | 22.841 |
| 44360.46875 | 22.826 |
| 44360.479166666664 | 22.759 |
| 44360.489583333336 | 22.662 |
| 44360.5 | 22.504 |
| 44360.510416666664 | 22.381 |
| 44360.520833333336 | 22.331 |
| 44360.53125 | 22.352 |
| 44360.541666666664 | 22.37 |
| 44360.552083333336 | 22.388 |
| 44360.5625 | 22.398 |
| 44360.572916666664 | 22.412 |
| 44360.583333333336 | 22.433 |
| 44360.59375 | 22.488 |
| 44360.604166666664 | 22.562 |
| 44360.614583333336 | 22.587 |
| 44360.625 | 22.587 |
| 44360.635416666664 | 22.683 |
| 44360.645833333336 | 22.983 |
| 44360.65625 | 22.946 |
| 44360.666666666664 | 23.561 |
| 44360.677083333336 | 23.814 |
| 44360.6875 | 24.067 |
| 44360.697916666664 | 24.402 |
| 44360.708333333336 | 24.837 |
| 44360.71875 | 25.032 |
| 44360.729166666664 | 25.087 |
| 44360.739583333336 | 25.143 |
| 44360.75 | 25.264 |
| 44360.760416666664 | 25.597 |
| 44360.770833333336 | 26.156 |
| 44360.78125 | 25.585 |
| 44360.791666666664 | 25.747 |
| 44360.802083333336 | 26.04 |
| 44360.8125 | 26.209 |
| 44360.822916666664 | 26.371 |
| 44360.833333333336 | 26.298 |
| 44360.84375 | 26.406 |
| 44360.854166666664 | 26.355 |
| 44360.864583333336 | 26.369 |
| 44360.875 | 26.369 |
| 44360.885416666664 | 26.508 |
| 44360.895833333336 | 26.432 |
| 44360.90625 | 26.426 |
| 44360.916666666664 | 26.385 |
| 44360.927083333336 | 26.374 |
| 44360.9375 | 26.243 |
| 44360.947916666664 | 26.09 |
| 44360.958333333336 | 25.996 |
| 44360.96875 | 25.905 |
| 44360.979166666664 | 25.702 |
| 44360.989583333336 | 25.407 |
| 44361.0 | 25.213 |
| 44361.010416666664 | 25.088 |
| 44361.020833333336 | 24.986 |
| 44361.03125 | 24.92 |
| 44361.041666666664 | 24.782 |
| 44361.052083333336 | 24.689 |
| 44361.0625 | 24.604 |
| 44361.072916666664 | 24.531 |
| 44361.083333333336 | 24.464 |
| 44361.09375 | 24.396 |
| 44361.104166666664 | 24.315 |
| 44361.114583333336 | 24.25 |
| 44361.125 | 24.167 |
| 44361.135416666664 | 24.09 |
| 44361.145833333336 | 24.028 |
| 44361.15625 | 23.995 |
| 44361.166666666664 | 23.955 |
| 44361.177083333336 | 24.013 |
| 44361.1875 | 24.006 |
| 44361.197916666664 | 23.911 |
| 44361.208333333336 | 23.952 |
| 44361.21875 | 23.721 |
| 44361.229166666664 | 23.619 |
| 44361.239583333336 | 23.631 |
| 44361.25 | 23.536 |
| 44361.260416666664 | 23.407 |
| 44361.270833333336 | 23.349 |
| 44361.28125 | 23.33 |
| 44361.291666666664 | 23.298 |
| 44361.302083333336 | 23.47 |
| 44361.3125 | 23.567 |
| 44361.322916666664 | 23.519 |
| 44361.333333333336 | 23.563 |
| 44361.34375 | 23.646 |
| 44361.354166666664 | 23.689 |
| 44361.364583333336 | 23.718 |
| 44361.375 | 23.761 |
| 44361.385416666664 | 23.805 |
| 44361.395833333336 | 23.818 |
| 44361.40625 | 23.83 |
| 44361.416666666664 | 23.819 |
| 44361.427083333336 | 23.816 |
| 44361.4375 | 23.819 |
| 44361.447916666664 | 23.823 |
| 44361.458333333336 | 23.813 |
| 44361.46875 | 23.769 |
| 44361.479166666664 | 23.759 |
| 44361.489583333336 | 23.763 |
| 44361.5 | 23.747 |
| 44361.510416666664 | 23.684 |
| 44361.520833333336 | 23.572 |
| 44361.53125 | 23.445 |
| 44361.541666666664 | 23.428 |
| 44361.552083333336 | 23.463 |
| 44361.5625 | 23.504 |
| 44361.572916666664 | 23.547 |
| 44361.583333333336 | 23.598 |
| 44361.59375 | 23.647 |
| 44361.604166666664 | 23.708 |
| 44361.614583333336 | 23.788 |
| 44361.625 | 23.856 |
| 44361.635416666664 | 23.928 |
| 44361.645833333336 | 23.991 |
| 44361.65625 | 24.083 |
| 44361.666666666664 | 24.183 |
| 44361.677083333336 | 24.333 |
| 44361.6875 | 24.441 |
| 44361.697916666664 | 24.312 |
| 44361.708333333336 | 24.884 |
| 44361.71875 | 25.793 |
| 44361.729166666664 | 26.524 |
| 44361.739583333336 | 27.048 |
| 44361.75 | 27.132 |
| 44361.760416666664 | 27.635 |
| 44361.770833333336 | 27.503 |
| 44361.78125 | 27.338 |
| 44361.791666666664 | 27.832 |
| 44361.802083333336 | 28.229 |
| 44361.8125 | 28.479 |
| 44361.822916666664 | 28.129 |
| 44361.833333333336 | 28.155 |
| 44361.84375 | 28.299 |
| 44361.854166666664 | 28.418 |
| 44361.864583333336 | 28.431 |
| 44361.875 | 28.479 |
| 44361.885416666664 | 28.584 |
| 44361.895833333336 | 28.63 |
| 44361.90625 | 28.613 |
| 44361.916666666664 | 28.534 |
| 44361.927083333336 | 28.438 |
| 44361.9375 | 28.478 |
| 44361.947916666664 | 28.319 |
| 44361.958333333336 | 28.104 |
| 44361.96875 | 27.955 |
| 44361.979166666664 | 27.716 |
| 44361.989583333336 | 27.546 |
| 44362.0 | 27.197 |
| 44362.010416666664 | 26.925 |
| 44362.020833333336 | 26.776 |
| 44362.03125 | 26.732 |
| 44362.041666666664 | 26.683 |
| 44362.052083333336 | 26.63 |
| 44362.0625 | 26.507 |
| 44362.072916666664 | 26.364 |
| 44362.083333333336 | 26.29 |
| 44362.09375 | 26.217 |
| 44362.104166666664 | 26.156 |
| 44362.114583333336 | 26.093 |
| 44362.125 | 26.001 |
| 44362.135416666664 | 25.946 |
| 44362.145833333336 | 25.864 |
| 44362.15625 | 25.775 |
| 44362.166666666664 | 25.68 |
| 44362.177083333336 | 25.611 |
| 44362.1875 | 25.553 |
| 44362.197916666664 | 25.568 |
| 44362.208333333336 | 25.595 |
| 44362.21875 | 25.665 |
| 44362.229166666664 | 25.634 |
| 44362.239583333336 | 25.57 |
| 44362.25 | 25.502 |
| 44362.260416666664 | 25.411 |
| 44362.270833333336 | 25.391 |
| 44362.28125 | 25.372 |
| 44362.291666666664 | 25.235 |
| 44362.302083333336 | 25.186 |
| 44362.3125 | 25.179 |
| 44362.322916666664 | 25.099 |
| 44362.333333333336 | 25.063 |
| 44362.34375 | 25.184 |
| 44362.354166666664 | 25.455 |
| 44362.364583333336 | 25.57 |
| 44362.375 | 25.637 |
| 44362.385416666664 | 25.699 |
| 44362.395833333336 | 25.705 |
| 44362.40625 | 25.718 |
| 44362.416666666664 | 25.743 |
| 44362.427083333336 | 25.49 |
| 44362.4375 | 25.439 |
| 44362.447916666664 | 25.445 |
| 44362.458333333336 | 25.319 |
| 44362.46875 | 25.328 |
| 44362.479166666664 | 25.399 |
| 44362.489583333336 | 25.463 |
| 44362.5 | 25.515 |
| 44362.510416666664 | 25.549 |
| 44362.520833333336 | 25.518 |
| 44362.53125 | 25.467 |
| 44362.541666666664 | 25.382 |
| 44362.552083333336 | 25.234 |
| 44362.5625 | 25.164 |
| 44362.572916666664 | 25.161 |
| 44362.583333333336 | 25.134 |
| 44362.59375 | 25.078 |
| 44362.604166666664 | 25.049 |
| 44362.614583333336 | 25.052 |
| 44362.625 | 25.061 |
| 44362.635416666664 | 25.11 |
| 44362.645833333336 | 25.122 |
| 44362.65625 | 25.173 |
| 44362.666666666664 | 25.216 |
| 44362.677083333336 | 25.269 |
| 44362.6875 | 25.302 |
| 44362.697916666664 | 25.383 |
| 44362.708333333336 | 25.427 |
| 44362.71875 | 25.43 |
| 44362.729166666664 | 25.482 |
| 44362.739583333336 | 25.519 |
| 44362.75 | 25.838 |
| 44362.760416666664 | 26.001 |
| 44362.770833333336 | 26.532 |
| 44362.78125 | 26.685 |
| 44362.791666666664 | 27.219 |
| 44362.802083333336 | 27.517 |
| 44362.8125 | 27.917 |
| 44362.822916666664 | 27.885 |
| 44362.833333333336 | 27.683 |
| 44362.84375 | 27.648 |
| 44362.854166666664 | 27.657 |
| 44362.864583333336 | 27.854 |
| 44362.875 | 28.017 |
| 44362.885416666664 | 28.199 |
| 44362.895833333336 | 28.208 |
| 44362.90625 | 28.278 |
| 44362.916666666664 | 28.308 |
| 44362.927083333336 | 28.254 |
| 44362.9375 | 28.263 |
| 44362.947916666664 | 28.225 |
| 44362.958333333336 | 28.239 |
| 44362.96875 | 28.198 |
| 44362.979166666664 | 28.137 |
| 44362.989583333336 | 28.082 |
| 44363.0 | 28.045 |
| 44363.010416666664 | 27.984 |
| 44363.020833333336 | 27.886 |
| 44363.03125 | 27.517 |
| 44363.041666666664 | 27.345 |
| 44363.052083333336 | 27.16 |
| 44363.0625 | 26.953 |
| 44363.072916666664 | 26.769 |
| 44363.083333333336 | 26.592 |
| 44363.09375 | 26.454 |
| 44363.104166666664 | 26.332 |
| 44363.114583333336 | 26.254 |
| 44363.125 | 26.193 |
| 44363.135416666664 | 26.151 |
| 44363.145833333336 | 26.074 |
| 44363.15625 | 25.925 |
| 44363.166666666664 | 25.819 |
| 44363.177083333336 | 25.73 |
| 44363.1875 | 25.666 |
| 44363.197916666664 | 25.604 |
| 44363.208333333336 | 25.56 |
| 44363.21875 | 25.526 |
| 44363.229166666664 | 25.523 |
| 44363.239583333336 | 25.546 |
| 44363.25 | 25.594 |
| 44363.260416666664 | 25.486 |
| 44363.270833333336 | 25.423 |
| 44363.28125 | 25.353 |
| 44363.291666666664 | 25.296 |
| 44363.302083333336 | 25.248 |
| 44363.3125 | 25.163 |
| 44363.322916666664 | 25.083 |
| 44363.333333333336 | 24.979 |
| 44363.34375 | 24.819 |
| 44363.354166666664 | 24.782 |
| 44363.364583333336 | 24.788 |
| 44363.375 | 24.896 |
| 44363.385416666664 | 24.966 |
| 44363.395833333336 | 25.014 |
| 44363.40625 | 25.087 |
| 44363.416666666664 | 25.153 |
| 44363.427083333336 | 25.203 |
| 44363.4375 | 25.241 |
| 44363.447916666664 | 25.249 |
| 44363.458333333336 | 25.267 |
| 44363.46875 | 25.303 |
| 44363.479166666664 | 25.31 |
| 44363.489583333336 | 25.342 |
| 44363.5 | 25.369 |
| 44363.510416666664 | 25.332 |
| 44363.520833333336 | 25.283 |
| 44363.53125 | 25.276 |
| 44363.541666666664 | 25.276 |
| 44363.552083333336 | 25.262 |
| 44363.5625 | 25.189 |
| 44363.572916666664 | 25.057 |
| 44363.583333333336 | 24.981 |
| 44363.59375 | 24.992 |
| 44363.604166666664 | 25.086 |
| 44363.614583333336 | 25.139 |
| 44363.625 | 25.2 |
| 44363.635416666664 | 25.206 |
| 44363.645833333336 | 25.261 |
| 44363.65625 | 25.355 |
| 44363.666666666664 | 25.449 |
| 44363.677083333336 | 25.524 |
| 44363.6875 | 25.56 |
| 44363.697916666664 | 25.578 |
| 44363.708333333336 | 25.586 |
| 44363.71875 | 25.589 |
| 44363.729166666664 | 25.624 |
| 44363.739583333336 | 25.673 |
| 44363.75 | 25.613 |
| 44363.760416666664 | 25.728 |
| 44363.770833333336 | 25.918 |
| 44363.78125 | 26.177 |
| 44363.791666666664 | 26.225 |
| 44363.802083333336 | 26.3 |
| 44363.8125 | 26.504 |
| 44363.822916666664 | 26.8 |
| 44363.833333333336 | 26.894 |
| 44363.84375 | 27.162 |
| 44363.854166666664 | 27.227 |
| 44363.864583333336 | 27.308 |
| 44363.875 | 27.204 |
| 44363.885416666664 | 27.167 |
| 44363.895833333336 | 27.187 |
| 44363.90625 | 27.188 |
| 44363.916666666664 | 27.121 |
| 44363.927083333336 | 27.242 |
| 44363.9375 | 27.179 |
| 44363.947916666664 | 27.213 |
| 44363.958333333336 | 27.131 |
| 44363.96875 | 27.065 |
| 44363.979166666664 | 27.043 |
| 44363.989583333336 | 27.066 |
| 44364.0 | 27.07 |
| 44364.010416666664 | 27.061 |
| 44364.020833333336 | 26.964 |
| 44364.03125 | 26.931 |
| 44364.041666666664 | 26.886 |
| 44364.052083333336 | 26.812 |
| 44364.0625 | 26.747 |
| 44364.072916666664 | 26.609 |
| 44364.083333333336 | 26.424 |
| 44364.09375 | 26.242 |
| 44364.104166666664 | 26.105 |
| 44364.114583333336 | 25.98 |
| 44364.125 | 25.873 |
| 44364.135416666664 | 25.748 |
| 44364.145833333336 | 25.638 |
| 44364.15625 | 25.547 |
| 44364.166666666664 | 25.476 |
| 44364.177083333336 | 25.407 |
| 44364.1875 | 25.358 |
| 44364.197916666664 | 25.318 |
| 44364.208333333336 | 25.276 |
| 44364.21875 | 25.228 |
| 44364.229166666664 | 25.181 |
| 44364.239583333336 | 25.143 |
| 44364.25 | 25.11 |
| 44364.260416666664 | 25.083 |
| 44364.270833333336 | 25.06 |
| 44364.28125 | 25.077 |
| 44364.291666666664 | 25.061 |
| 44364.302083333336 | 24.882 |
| 44364.3125 | 24.614 |
| 44364.322916666664 | 24.488 |
| 44364.333333333336 | 24.271 |
| 44364.34375 | 24.184 |
| 44364.354166666664 | 23.949 |
| 44364.364583333336 | 23.95 |
| 44364.375 | 23.797 |
| 44364.385416666664 | 23.815 |
| 44364.395833333336 | 23.861 |
| 44364.40625 | 23.969 |
| 44364.416666666664 | 23.945 |
| 44364.427083333336 | 23.91 |
| 44364.4375 | 23.942 |
| 44364.447916666664 | 23.954 |
| 44364.458333333336 | 23.912 |
| 44364.46875 | 23.942 |
| 44364.479166666664 | 23.965 |
| 44364.489583333336 | 24.001 |
| 44364.5 | 24.054 |
| 44364.510416666664 | 24.083 |
| 44364.520833333336 | 24.165 |
| 44364.53125 | 24.191 |
| 44364.541666666664 | 24.133 |
| 44364.552083333336 | 24.129 |
| 44364.5625 | 24.127 |
| 44364.572916666664 | 24.129 |
| 44364.583333333336 | 24.149 |
| 44364.59375 | 24.135 |
| 44364.604166666664 | 24.113 |
| 44364.614583333336 | 24.172 |
| 44364.625 | 24.303 |
| 44364.635416666664 | 24.419 |
| 44364.645833333336 | 24.508 |
| 44364.65625 | 24.594 |
| 44364.666666666664 | 24.665 |
| 44364.677083333336 | 24.733 |
| 44364.6875 | 24.829 |
| 44364.697916666664 | 24.915 |
| 44364.708333333336 | 24.996 |
| 44364.71875 | 25.071 |
| 44364.729166666664 | 25.147 |
| 44364.739583333336 | 25.222 |
| 44364.75 | 25.291 |
| 44364.760416666664 | 25.351 |
| 44364.770833333336 | 25.31 |
| 44364.78125 | 25.518 |
| 44364.791666666664 | 25.511 |
| 44364.802083333336 | 25.599 |
| 44364.8125 | 25.703 |
| 44364.822916666664 | 25.889 |
| 44364.833333333336 | 26.372 |
| 44364.84375 | 26.786 |
| 44364.854166666664 | 27.277 |
| 44364.864583333336 | 27.269 |
| 44364.875 | 27.413 |
| 44364.885416666664 | 27.267 |
| 44364.895833333336 | 27.635 |
| 44364.90625 | 27.393 |
| 44364.916666666664 | 27.449 |
| 44364.927083333336 | 27.44 |
| 44364.9375 | 27.671 |
| 44364.947916666664 | 27.424 |
| 44364.958333333336 | 27.424 |
| 44364.96875 | 27.313 |
| 44364.979166666664 | 27.184 |
| 44364.989583333336 | 27.098 |
| 44365.0 | 27.042 |
| 44365.010416666664 | 27.003 |
| 44365.020833333336 | 27 |
| 44365.03125 | 26.978 |
| 44365.041666666664 | 26.952 |
| 44365.052083333336 | 26.893 |
| 44365.0625 | 26.863 |
| 44365.072916666664 | 26.865 |
| 44365.083333333336 | 26.854 |
| 44365.09375 | 26.846 |
| 44365.104166666664 | 26.763 |
| 44365.114583333336 | 26.64 |
| 44365.125 | 26.356 |
| 44365.135416666664 | 26.089 |
| 44365.145833333336 | 25.953 |
| 44365.15625 | 25.834 |
| 44365.166666666664 | 25.718 |
| 44365.177083333336 | 25.607 |
| 44365.1875 | 25.51 |
| 44365.197916666664 | 25.423 |
| 44365.208333333336 | 25.337 |
| 44365.21875 | 25.277 |
| 44365.229166666664 | 25.22 |
| 44365.239583333336 | 25.14 |
| 44365.25 | 25.031 |
| 44365.260416666664 | 24.972 |
| 44365.270833333336 | 24.914 |
| 44365.28125 | 24.878 |
| 44365.291666666664 | 24.846 |
| 44365.302083333336 | 24.866 |
| 44365.3125 | 24.924 |
| 44365.322916666664 | 24.764 |
| 44365.333333333336 | 24.594 |
| 44365.34375 | 24.338 |
| 44365.354166666664 | 24.131 |
| 44365.364583333336 | 23.94 |
| 44365.375 | 23.894 |
| 44365.385416666664 | 23.704 |
| 44365.395833333336 | 23.568 |
| 44365.40625 | 23.52 |
| 44365.416666666664 | 23.642 |
| 44365.427083333336 | 23.617 |
| 44365.4375 | 23.613 |
| 44365.447916666664 | 23.639 |
| 44365.458333333336 | 23.702 |
| 44365.46875 | 23.776 |
| 44365.479166666664 | 23.763 |
| 44365.489583333336 | 23.832 |
| 44365.5 | 23.864 |
| 44365.510416666664 | 23.92 |
| 44365.520833333336 | 23.922 |
| 44365.53125 | 24.005 |
| 44365.541666666664 | 24.029 |
| 44365.552083333336 | 24.086 |
| 44365.5625 | 24.148 |
| 44365.572916666664 | 24.196 |
| 44365.583333333336 | 24.202 |
| 44365.59375 | 24.196 |
| 44365.604166666664 | 24.215 |
| 44365.614583333336 | 24.258 |
| 44365.625 | 24.329 |
| 44365.635416666664 | 24.42 |
| 44365.645833333336 | 24.544 |
| 44365.65625 | 24.723 |
| 44365.666666666664 | 24.793 |
| 44365.677083333336 | 24.885 |
| 44365.6875 | 24.986 |
| 44365.697916666664 | 25.116 |
| 44365.708333333336 | 25.261 |
| 44365.71875 | 25.39 |
| 44365.729166666664 | 25.48 |
| 44365.739583333336 | 25.542 |
| 44365.75 | 25.588 |
| 44365.760416666664 | 25.609 |
| 44365.770833333336 | 25.686 |
| 44365.78125 | 25.727 |
| 44365.791666666664 | 25.771 |
| 44365.802083333336 | 25.794 |
| 44365.8125 | 25.82 |
| 44365.822916666664 | 25.849 |
| 44365.833333333336 | 25.869 |
| 44365.84375 | 25.808 |
| 44365.854166666664 | 25.797 |
| 44365.864583333336 | 26.152 |
| 44365.875 | 26.598 |
| 44365.885416666664 | 26.891 |
| 44365.895833333336 | 27.254 |
| 44365.90625 | 27.48 |
| 44365.916666666664 | 27.421 |
| 44365.927083333336 | 27.001 |
| 44365.9375 | 27.013 |
| 44365.947916666664 | 26.955 |
| 44365.958333333336 | 27.021 |
| 44365.96875 | 26.975 |
| 44365.979166666664 | 26.774 |
| 44365.989583333336 | 26.704 |
| 44366.0 | 26.62 |
| 44366.010416666664 | 26.541 |
| 44366.020833333336 | 26.444 |
| 44366.03125 | 26.367 |
| 44366.041666666664 | 26.294 |
| 44366.052083333336 | 26.235 |
| 44366.0625 | 26.166 |
| 44366.072916666664 | 26.164 |
| 44366.083333333336 | 26.123 |
| 44366.09375 | 26.118 |
| 44366.104166666664 | 26.126 |
| 44366.114583333336 | 26.105 |
| 44366.125 | 26.128 |
| 44366.135416666664 | 26.056 |
| 44366.145833333336 | 25.908 |
| 44366.15625 | 25.744 |
| 44366.166666666664 | 25.384 |
| 44366.177083333336 | 25.232 |
| 44366.1875 | 25.124 |
| 44366.197916666664 | 24.997 |
| 44366.208333333336 | 24.842 |
| 44366.21875 | 24.717 |
| 44366.229166666664 | 24.628 |
| 44366.239583333336 | 24.543 |
| 44366.25 | 24.486 |
| 44366.260416666664 | 24.438 |
| 44366.270833333336 | 24.405 |
| 44366.28125 | 24.351 |
| 44366.291666666664 | 24.323 |
| 44366.302083333336 | 24.283 |
| 44366.3125 | 24.259 |
| 44366.322916666664 | 24.24 |
| 44366.333333333336 | 24.207 |
| 44366.34375 | 24.242 |
| 44366.354166666664 | 24.314 |
| 44366.364583333336 | 24.199 |
| 44366.375 | 24.053 |
| 44366.385416666664 | 23.958 |
| 44366.395833333336 | 23.937 |
| 44366.40625 | 23.724 |
| 44366.416666666664 | 23.605 |
| 44366.427083333336 | 23.752 |
| 44366.4375 | 23.645 |
| 44366.447916666664 | 23.567 |
| 44366.458333333336 | 23.715 |
| 44366.46875 | 23.851 |
| 44366.479166666664 | 23.857 |
| 44366.489583333336 | 23.861 |
| 44366.5 | 23.863 |
| 44366.510416666664 | 23.832 |
| 44366.520833333336 | 23.906 |
| 44366.53125 | 23.952 |
| 44366.541666666664 | 24.032 |
| 44366.552083333336 | 24.101 |
| 44366.5625 | 24.191 |
| 44366.572916666664 | 24.303 |
| 44366.583333333336 | 24.418 |
| 44366.59375 | 24.35 |
| 44366.604166666664 | 24.515 |
| 44366.614583333336 | 24.541 |
| 44366.625 | 24.531 |
| 44366.635416666664 | 24.512 |
| 44366.645833333336 | 24.596 |
| 44366.65625 | 24.67 |
| 44366.666666666664 | 24.829 |
| 44366.677083333336 | 25.105 |
| 44366.6875 | 25.337 |
| 44366.697916666664 | 25.457 |
| 44366.708333333336 | 25.649 |
| 44366.71875 | 25.917 |
| 44366.729166666664 | 26.073 |
| 44366.739583333336 | 26.187 |
| 44366.75 | 26.308 |
| 44366.760416666664 | 26.364 |
| 44366.770833333336 | 26.427 |
| 44366.78125 | 26.463 |
| 44366.791666666664 | 26.436 |
| 44366.802083333336 | 26.379 |
| 44366.8125 | 26.318 |
| 44366.822916666664 | 26.315 |
| 44366.833333333336 | 26.332 |
| 44366.84375 | 26.342 |
| 44366.854166666664 | 26.409 |
| 44366.864583333336 | 26.403 |
| 44366.875 | 26.345 |
| 44366.885416666664 | 26.509 |
| 44366.895833333336 | 26.737 |
| 44366.90625 | 27.039 |
| 44366.916666666664 | 27.691 |
| 44366.927083333336 | 27.862 |
| 44366.9375 | 28.473 |
| 44366.947916666664 | 28.254 |
| 44366.958333333336 | 27.698 |
| 44366.96875 | 28.459 |
| 44366.979166666664 | 28.258 |
| 44366.989583333336 | 27.981 |
| 44367.0 | 28.19 |
| 44367.010416666664 | 28.539 |
| 44367.020833333336 | 28.458 |
| 44367.03125 | 28.235 |
| 44367.041666666664 | 28.086 |
| 44367.052083333336 | 27.925 |
| 44367.0625 | 27.774 |
| 44367.072916666664 | 27.636 |
| 44367.083333333336 | 27.525 |
| 44367.09375 | 27.469 |
| 44367.104166666664 | 27.433 |
| 44367.114583333336 | 27.405 |
| 44367.125 | 27.432 |
| 44367.135416666664 | 27.445 |
| 44367.145833333336 | 27.469 |
| 44367.15625 | 27.448 |
| 44367.166666666664 | 27.469 |
| 44367.177083333336 | 27.481 |
| 44367.1875 | 27.463 |
| 44367.197916666664 | 27.412 |
| 44367.208333333336 | 27.244 |
| 44367.21875 | 27.178 |
| 44367.229166666664 | 27.132 |
| 44367.239583333336 | 27.081 |
| 44367.25 | 26.976 |
| 44367.260416666664 | 26.821 |
| 44367.270833333336 | 26.715 |
| 44367.28125 | 26.61 |
| 44367.291666666664 | 26.514 |
| 44367.302083333336 | 26.416 |
| 44367.3125 | 26.256 |
| 44367.322916666664 | 26.093 |
| 44367.333333333336 | 25.972 |
| 44367.34375 | 25.892 |
| 44367.354166666664 | 25.819 |
| 44367.364583333336 | 25.788 |
| 44367.375 | 25.755 |
| 44367.385416666664 | 25.797 |
| 44367.395833333336 | 25.886 |
| 44367.40625 | 25.844 |
| 44367.416666666664 | 25.744 |
| 44367.427083333336 | 25.691 |
| 44367.4375 | 25.552 |
| 44367.447916666664 | 25.614 |
| 44367.458333333336 | 25.506 |
| 44367.46875 | 25.458 |
| 44367.479166666664 | 25.458 |
| 44367.489583333336 | 25.467 |
| 44367.5 | 25.613 |
| 44367.510416666664 | 25.72 |
| 44367.520833333336 | 25.744 |
| 44367.53125 | 25.833 |
| 44367.541666666664 | 25.901 |
| 44367.552083333336 | 25.967 |
| 44367.5625 | 26.002 |
| 44367.572916666664 | 26.12 |
| 44367.583333333336 | 26.181 |
| 44367.59375 | 26.233 |
| 44367.604166666664 | 26.313 |
| 44367.614583333336 | 26.359 |
| 44367.625 | 26.425 |
| 44367.635416666664 | 26.527 |
| 44367.645833333336 | 26.49 |
| 44367.65625 | 26.439 |
| 44367.666666666664 | 26.431 |
| 44367.677083333336 | 26.435 |
| 44367.6875 | 26.48 |
| 44367.697916666664 | 26.524 |
| 44367.708333333336 | 26.639 |
| 44367.71875 | 26.796 |
| 44367.729166666664 | 26.87 |
| 44367.739583333336 | 26.969 |
| 44367.75 | 27.136 |
| 44367.760416666664 | 27.221 |
| 44367.770833333336 | 27.297 |
| 44367.78125 | 27.356 |
| 44367.791666666664 | 27.359 |
| 44367.802083333336 | 27.265 |
| 44367.8125 | 27.25 |
| 44367.822916666664 | 27.24 |
| 44367.833333333336 | 27.226 |
| 44367.84375 | 27.212 |
| 44367.854166666664 | 27.202 |
| 44367.864583333336 | 27.159 |
| 44367.875 | 27.129 |
| 44367.885416666664 | 27.051 |
| 44367.895833333336 | 26.979 |
| 44367.90625 | 26.975 |
| 44367.916666666664 | 27.135 |
| 44367.927083333336 | 27.047 |
| 44367.9375 | 27.196 |
| 44367.947916666664 | 27.196 |
| 44367.958333333336 | 27.247 |
| 44367.96875 | 27.365 |
| 44367.979166666664 | 27.533 |
| 44367.989583333336 | 27.706 |
| 44368.0 | 27.675 |
| 44368.010416666664 | 27.692 |
| 44368.020833333336 | 27.647 |
| 44368.03125 | 27.758 |
| 44368.041666666664 | 27.757 |
| 44368.052083333336 | 27.796 |
| 44368.0625 | 27.815 |
| 44368.072916666664 | 27.856 |
| 44368.083333333336 | 27.795 |
| 44368.09375 | 27.662 |
| 44368.104166666664 | 27.669 |
| 44368.114583333336 | 27.678 |
| 44368.125 | 27.661 |
| 44368.135416666664 | 27.654 |
| 44368.145833333336 | 27.615 |
| 44368.15625 | 27.592 |
| 44368.166666666664 | 27.595 |
| 44368.177083333336 | 27.538 |
| 44368.1875 | 27.538 |
| 44368.197916666664 | 27.519 |
| 44368.208333333336 | 27.5 |
| 44368.21875 | 27.423 |
| 44368.229166666664 | 27.321 |
| 44368.239583333336 | 27.18 |
| 44368.25 | 27.004 |
| 44368.260416666664 | 26.922 |
| 44368.270833333336 | 26.881 |
| 44368.28125 | 26.76 |
| 44368.291666666664 | 26.669 |
| 44368.302083333336 | 26.571 |
| 44368.3125 | 26.488 |
| 44368.322916666664 | 26.416 |
| 44368.333333333336 | 26.373 |
| 44368.34375 | 26.318 |
| 44368.354166666664 | 26.25 |
| 44368.364583333336 | 26.193 |
| 44368.375 | 26.142 |
| 44368.385416666664 | 26.089 |
| 44368.395833333336 | 26.068 |
| 44368.40625 | 26.014 |
| 44368.416666666664 | 25.989 |
| 44368.427083333336 | 26.011 |
| 44368.4375 | 26.139 |
| 44368.447916666664 | 26.105 |
| 44368.458333333336 | 25.99 |
| 44368.46875 | 25.878 |
| 44368.479166666664 | 25.861 |
| 44368.489583333336 | 25.788 |
| 44368.5 | 25.789 |
| 44368.510416666664 | 25.735 |
| 44368.520833333336 | 25.733 |
| 44368.53125 | 25.725 |
| 44368.541666666664 | 25.799 |
| 44368.552083333336 | 25.863 |
| 44368.5625 | 25.951 |
| 44368.572916666664 | 26.102 |
| 44368.583333333336 | 26.188 |
| 44368.59375 | 26.254 |
| 44368.604166666664 | 26.337 |
| 44368.614583333336 | 26.408 |
| 44368.625 | 26.458 |
| 44368.635416666664 | 26.522 |
| 44368.645833333336 | 26.579 |
| 44368.65625 | 26.63 |
| 44368.666666666664 | 26.723 |
| 44368.677083333336 | 26.664 |
| 44368.6875 | 26.689 |
| 44368.697916666664 | 26.776 |
| 44368.708333333336 | 26.827 |
| 44368.71875 | 26.927 |
| 44368.729166666664 | 27.076 |
| 44368.739583333336 | 27.289 |
| 44368.75 | 27.378 |
| 44368.760416666664 | 27.489 |
| 44368.770833333336 | 27.732 |
| 44368.78125 | 27.849 |
| 44368.791666666664 | 28.023 |
| 44368.802083333336 | 28.109 |
| 44368.8125 | 28.174 |
| 44368.822916666664 | 28.205 |
| 44368.833333333336 | 28.18 |
| 44368.84375 | 28.135 |
| 44368.854166666664 | 28.066 |
| 44368.864583333336 | 28.034 |
| 44368.875 | 27.907 |
| 44368.885416666664 | 27.906 |
| 44368.895833333336 | 27.896 |
| 44368.90625 | 27.92 |
| 44368.916666666664 | 27.916 |
| 44368.927083333336 | 27.873 |
| 44368.9375 | 27.842 |
| 44368.947916666664 | 27.825 |
| 44368.958333333336 | 27.755 |
| 44368.96875 | 27.831 |
| 44368.979166666664 | 27.809 |
| 44368.989583333336 | 27.802 |
| 44369.0 | 27.872 |
| 44369.010416666664 | 27.888 |
| 44369.020833333336 | 28.067 |
| 44369.03125 | 28.085 |
| 44369.041666666664 | 28.135 |
| 44369.052083333336 | 28.286 |
| 44369.0625 | 28.346 |
| 44369.072916666664 | 28.511 |
| 44369.083333333336 | 28.62 |
| 44369.09375 | 28.598 |
| 44369.104166666664 | 28.603 |
| 44369.114583333336 | 28.546 |
| 44369.125 | 28.479 |
| 44369.135416666664 | 28.468 |
| 44369.145833333336 | 28.422 |
| 44369.15625 | 28.396 |
| 44369.166666666664 | 28.443 |
| 44369.177083333336 | 28.429 |
| 44369.1875 | 28.396 |
| 44369.197916666664 | 28.452 |
| 44369.208333333336 | 28.455 |
| 44369.21875 | 28.406 |
| 44369.229166666664 | 28.358 |
| 44369.239583333336 | 28.361 |
| 44369.25 | 28.347 |
| 44369.260416666664 | 28.309 |
| 44369.270833333336 | 28.21 |
| 44369.28125 | 28.12 |
| 44369.291666666664 | 27.914 |
| 44369.302083333336 | 27.714 |
| 44369.3125 | 27.666 |
| 44369.322916666664 | 27.608 |
| 44369.333333333336 | 27.592 |
| 44369.34375 | 27.53 |
| 44369.354166666664 | 27.496 |
| 44369.364583333336 | 27.424 |
| 44369.375 | 27.365 |
| 44369.385416666664 | 27.268 |
| 44369.395833333336 | 27.178 |
| 44369.40625 | 26.982 |
| 44369.416666666664 | 26.827 |
| 44369.427083333336 | 26.729 |
| 44369.4375 | 26.633 |
| 44369.447916666664 | 26.585 |
| 44369.458333333336 | 26.577 |
| 44369.46875 | 26.546 |
| 44369.479166666664 | 26.521 |
| 44369.489583333336 | 26.643 |
| 44369.5 | 26.684 |
| 44369.510416666664 | 26.755 |
| 44369.520833333336 | 26.689 |
| 44369.53125 | 26.688 |
| 44369.541666666664 | 26.811 |
| 44369.552083333336 | 26.87 |
| 44369.5625 | 26.966 |
| 44369.572916666664 | 27.054 |
| 44369.583333333336 | 27.246 |
| 44369.59375 | 27.382 |
| 44369.604166666664 | 27.484 |
| 44369.614583333336 | 27.591 |
| 44369.625 | 27.754 |
| 44369.635416666664 | 27.864 |
| 44369.645833333336 | 27.974 |
| 44369.65625 | 28.079 |
| 44369.666666666664 | 28.166 |
| 44369.677083333336 | 28.234 |
| 44369.6875 | 28.431 |
| 44369.697916666664 | 28.554 |
| 44369.708333333336 | 28.534 |
| 44369.71875 | 28.461 |
| 44369.729166666664 | 28.327 |
| 44369.739583333336 | 28.242 |
| 44369.75 | 28.131 |
| 44369.760416666664 | 28.038 |
| 44369.770833333336 | 27.905 |
| 44369.78125 | 27.761 |
| 44369.791666666664 | 27.616 |
| 44369.802083333336 | 27.502 |
| 44369.8125 | 27.299 |
| 44369.822916666664 | 27.129 |
| 44369.833333333336 | 26.971 |
| 44369.84375 | 26.818 |
| 44369.854166666664 | 26.691 |
| 44369.864583333336 | 26.6 |
| 44369.875 | 26.595 |
| 44369.885416666664 | 26.548 |
| 44369.895833333336 | 26.501 |
| 44369.90625 | 26.377 |
| 44369.916666666664 | 26.281 |
| 44369.927083333336 | 26.223 |
| 44369.9375 | 26.202 |
| 44369.947916666664 | 26.187 |
| 44369.958333333336 | 26.2 |
| 44369.96875 | 26.212 |
| 44369.979166666664 | 26.227 |
| 44369.989583333336 | 26.205 |
| 44370.0 | 26.062 |
| 44370.010416666664 | 25.983 |
| 44370.020833333336 | 25.974 |
| 44370.03125 | 26.046 |
| 44370.041666666664 | 25.928 |
| 44370.052083333336 | 25.939 |
| 44370.0625 | 25.86 |
| 44370.072916666664 | 25.851 |
| 44370.083333333336 | 25.796 |
| 44370.09375 | 25.767 |
| 44370.104166666664 | 25.722 |
| 44370.114583333336 | 25.61 |
| 44370.125 | 25.531 |
| 44370.135416666664 | 25.435 |
| 44370.145833333336 | 25.369 |
| 44370.15625 | 25.291 |
| 44370.166666666664 | 25.242 |
| 44370.177083333336 | 25.24 |
| 44370.1875 | 25.258 |
| 44370.197916666664 | 25.21 |
| 44370.208333333336 | 25.214 |
| 44370.21875 | 25.224 |
| 44370.229166666664 | 25.226 |
| 44370.239583333336 | 25.137 |
| 44370.25 | 25.146 |
| 44370.260416666664 | 25.259 |
| 44370.270833333336 | 25.13 |
| 44370.28125 | 25.225 |
| 44370.291666666664 | 25.242 |
| 44370.302083333336 | 25.151 |
| 44370.3125 | 25.006 |
| 44370.322916666664 | 24.85 |
| 44370.333333333336 | 24.674 |
| 44370.34375 | 24.542 |
| 44370.354166666664 | 24.432 |
| 44370.364583333336 | 24.311 |
| 44370.375 | 24.196 |
| 44370.385416666664 | 24.104 |
| 44370.395833333336 | 24.031 |
| 44370.40625 | 23.954 |
| 44370.416666666664 | 23.862 |
| 44370.427083333336 | 23.813 |
| 44370.4375 | 23.814 |
| 44370.447916666664 | 23.806 |
| 44370.458333333336 | 23.772 |
| 44370.46875 | 23.737 |
| 44370.479166666664 | 23.696 |
| 44370.489583333336 | 23.643 |
| 44370.5 | 23.626 |
| 44370.510416666664 | 23.62 |
| 44370.520833333336 | 23.777 |
| 44370.53125 | 23.692 |
| 44370.541666666664 | 23.705 |
| 44370.552083333336 | 23.632 |
| 44370.5625 | 23.535 |
| 44370.572916666664 | 23.506 |
| 44370.583333333336 | 23.683 |
| 44370.59375 | 23.642 |
| 44370.604166666664 | 23.666 |
| 44370.614583333336 | 23.776 |
| 44370.625 | 23.801 |
| 44370.635416666664 | 23.928 |
| 44370.645833333336 | 24.016 |
| 44370.65625 | 24.254 |
| 44370.666666666664 | 24.499 |
| 44370.677083333336 | 24.774 |
| 44370.6875 | 24.94 |
| 44370.697916666664 | 25.184 |
| 44370.708333333336 | 25.317 |
| 44370.71875 | 25.418 |
| 44370.729166666664 | 25.58 |
| 44370.739583333336 | 25.715 |
| 44370.75 | 25.803 |
| 44370.760416666664 | 25.885 |
| 44370.770833333336 | 25.761 |
| 44370.78125 | 25.754 |
| 44370.791666666664 | 25.753 |
| 44370.802083333336 | 25.704 |
| 44370.8125 | 25.71 |
| 44370.822916666664 | 25.618 |
| 44370.833333333336 | 25.635 |
| 44370.84375 | 25.773 |
| 44370.854166666664 | 25.853 |
| 44370.864583333336 | 25.927 |
| 44370.875 | 25.979 |
| 44370.885416666664 | 26.035 |
| 44370.895833333336 | 26.088 |
| 44370.90625 | 25.96 |
| 44370.916666666664 | 25.803 |
| 44370.927083333336 | 25.609 |
| 44370.9375 | 25.383 |
| 44370.947916666664 | 25.163 |
| 44370.958333333336 | 25.058 |
| 44370.96875 | 24.981 |
| 44370.979166666664 | 24.938 |
| 44370.989583333336 | 24.823 |
| 44371.0 | 24.798 |
| 44371.010416666664 | 24.691 |
| 44371.020833333336 | 24.598 |
| 44371.03125 | 24.474 |
| 44371.041666666664 | 24.402 |
| 44371.052083333336 | 24.566 |
| 44371.0625 | 24.473 |
| 44371.072916666664 | 24.525 |
| 44371.083333333336 | 24.31 |
| 44371.09375 | 24.209 |
| 44371.104166666664 | 24.182 |
| 44371.114583333336 | 24.183 |
| 44371.125 | 24.218 |
| 44371.135416666664 | 24.163 |
| 44371.145833333336 | 24.153 |
| 44371.15625 | 24.077 |
| 44371.166666666664 | 24 |
| 44371.177083333336 | 23.834 |
| 44371.1875 | 23.8 |
| 44371.197916666664 | 23.897 |
| 44371.208333333336 | 23.863 |
| 44371.21875 | 24.046 |
| 44371.229166666664 | 24.133 |
| 44371.239583333336 | 24.117 |
| 44371.25 | 24.161 |
| 44371.260416666664 | 24.112 |
| 44371.270833333336 | 24.07 |
| 44371.28125 | 23.999 |
| 44371.291666666664 | 24.03 |
| 44371.302083333336 | 24.019 |
| 44371.3125 | 23.922 |
| 44371.322916666664 | 23.922 |
| 44371.333333333336 | 23.939 |
| 44371.34375 | 23.961 |
| 44371.354166666664 | 23.922 |
| 44371.364583333336 | 23.777 |
| 44371.375 | 23.643 |
| 44371.385416666664 | 23.393 |
| 44371.395833333336 | 23.175 |
| 44371.40625 | 23.019 |
| 44371.416666666664 | 22.913 |
| 44371.427083333336 | 22.732 |
| 44371.4375 | 22.584 |
| 44371.447916666664 | 22.485 |
| 44371.458333333336 | 22.361 |
| 44371.46875 | 22.342 |
| 44371.479166666664 | 22.391 |
| 44371.489583333336 | 22.391 |
| 44371.5 | 22.368 |
| 44371.510416666664 | 22.348 |
| 44371.520833333336 | 22.34 |
| 44371.53125 | 22.332 |
| 44371.541666666664 | 22.436 |
| 44371.552083333336 | 22.566 |
| 44371.5625 | 22.529 |
| 44371.572916666664 | 22.521 |
| 44371.583333333336 | 22.597 |
| 44371.59375 | 22.624 |
| 44371.604166666664 | 22.794 |
| 44371.614583333336 | 22.909 |
| 44371.625 | 23.217 |
| 44371.635416666664 | 23.249 |
| 44371.645833333336 | 23.321 |
| 44371.65625 | 23.353 |
| 44371.666666666664 | 23.626 |
| 44371.677083333336 | 23.773 |
| 44371.6875 | 24.037 |
| 44371.697916666664 | 24.331 |
| 44371.708333333336 | 24.519 |
| 44371.71875 | 24.601 |
| 44371.729166666664 | 24.732 |
| 44371.739583333336 | 24.89 |
| 44371.75 | 24.947 |
| 44371.760416666664 | 24.955 |
| 44371.770833333336 | 25.106 |
| 44371.78125 | 25.117 |
| 44371.791666666664 | 25.017 |
| 44371.802083333336 | 25.159 |
| 44371.8125 | 25.137 |
| 44371.822916666664 | 25.068 |
| 44371.833333333336 | 25.085 |
| 44371.84375 | 25.056 |
| 44371.854166666664 | 25.024 |
| 44371.864583333336 | 24.989 |
| 44371.875 | 25.008 |
| 44371.885416666664 | 25.081 |
| 44371.895833333336 | 25.188 |
| 44371.90625 | 25.164 |
| 44371.916666666664 | 25.142 |
| 44371.927083333336 | 25.078 |
| 44371.9375 | 24.966 |
| 44371.947916666664 | 24.798 |
| 44371.958333333336 | 24.547 |
| 44371.96875 | 24.339 |
| 44371.979166666664 | 24.155 |
| 44371.989583333336 | 23.941 |
| 44372.0 | 23.785 |
| 44372.010416666664 | 23.668 |
| 44372.020833333336 | 23.614 |
| 44372.03125 | 23.565 |
| 44372.041666666664 | 23.514 |
| 44372.052083333336 | 23.468 |
| 44372.0625 | 23.431 |
| 44372.072916666664 | 23.596 |
| 44372.083333333336 | 23.611 |
| 44372.09375 | 23.437 |
| 44372.104166666664 | 23.395 |
| 44372.114583333336 | 23.323 |
| 44372.125 | 23.406 |
| 44372.135416666664 | 23.197 |
| 44372.145833333336 | 23.208 |
| 44372.15625 | 23.193 |
| 44372.166666666664 | 23.199 |
| 44372.177083333336 | 23.117 |
| 44372.1875 | 23.021 |
| 44372.197916666664 | 22.987 |
| 44372.208333333336 | 22.913 |
| 44372.21875 | 22.861 |
| 44372.229166666664 | 22.804 |
| 44372.239583333336 | 22.784 |
| 44372.25 | 22.809 |
| 44372.260416666664 | 22.99 |
| 44372.270833333336 | 23.137 |
| 44372.28125 | 22.981 |
| 44372.291666666664 | 23.142 |
| 44372.302083333336 | 23.17 |
| 44372.3125 | 23.14 |
| 44372.322916666664 | 23.112 |
| 44372.333333333336 | 23.124 |
| 44372.34375 | 23.122 |
| 44372.354166666664 | 23.038 |
| 44372.364583333336 | 23.082 |
| 44372.375 | 23.105 |
| 44372.385416666664 | 23.078 |
| 44372.395833333336 | 23.039 |
| 44372.40625 | 22.948 |
| 44372.416666666664 | 22.765 |
| 44372.427083333336 | 22.59 |
| 44372.4375 | 22.479 |
| 44372.447916666664 | 22.445 |
| 44372.458333333336 | 22.396 |
| 44372.46875 | 22.323 |
| 44372.479166666664 | 22.251 |
| 44372.489583333336 | 22.196 |
| 44372.5 | 22.177 |
| 44372.510416666664 | 22.216 |
| 44372.520833333336 | 22.232 |
| 44372.53125 | 22.214 |
| 44372.541666666664 | 22.24 |
| 44372.552083333336 | 22.27 |
| 44372.5625 | 22.284 |
| 44372.572916666664 | 22.365 |
| 44372.583333333336 | 22.428 |
| 44372.59375 | 22.699 |
| 44372.604166666664 | 22.669 |
| 44372.614583333336 | 22.935 |
| 44372.625 | 22.816 |
| 44372.635416666664 | 23.126 |
| 44372.645833333336 | 23.534 |
| 44372.65625 | 23.612 |
| 44372.666666666664 | 23.534 |
| 44372.677083333336 | 23.689 |
| 44372.6875 | 23.928 |
| 44372.697916666664 | 24.012 |
| 44372.708333333336 | 24.199 |
| 44372.71875 | 24.445 |
| 44372.729166666664 | 24.623 |
| 44372.739583333336 | 24.995 |
| 44372.75 | 25.257 |
| 44372.760416666664 | 25.517 |
| 44372.770833333336 | 25.614 |
| 44372.78125 | 25.884 |
| 44372.791666666664 | 26.116 |
| 44372.802083333336 | 26.438 |
| 44372.8125 | 26.599 |
| 44372.822916666664 | 26.435 |
| 44372.833333333336 | 26.561 |
| 44372.84375 | 26.424 |
| 44372.854166666664 | 26.289 |
| 44372.864583333336 | 26.247 |
| 44372.875 | 26.126 |
| 44372.885416666664 | 25.977 |
| 44372.895833333336 | 25.866 |
| 44372.90625 | 25.793 |
| 44372.916666666664 | 25.773 |
| 44372.927083333336 | 25.777 |
| 44372.9375 | 25.783 |
| 44372.947916666664 | 25.736 |
| 44372.958333333336 | 25.634 |
| 44372.96875 | 25.589 |
| 44372.979166666664 | 25.394 |
| 44372.989583333336 | 25.082 |
| 44373.0 | 24.781 |
| 44373.010416666664 | 24.527 |
| 44373.020833333336 | 24.342 |
| 44373.03125 | 24.238 |
| 44373.041666666664 | 24.166 |
| 44373.052083333336 | 24.152 |
| 44373.0625 | 24.117 |
| 44373.072916666664 | 24.082 |
| 44373.083333333336 | 24.06 |
| 44373.09375 | 24.013 |
| 44373.104166666664 | 23.965 |
| 44373.114583333336 | 23.889 |
| 44373.125 | 24.032 |
| 44373.135416666664 | 24.12 |
| 44373.145833333336 | 24.092 |
| 44373.15625 | 24.12 |
| 44373.166666666664 | 24.179 |
| 44373.177083333336 | 24.107 |
| 44373.1875 | 24.226 |
| 44373.197916666664 | 24.263 |
| 44373.208333333336 | 24.301 |
| 44373.21875 | 24.353 |
| 44373.229166666664 | 24.354 |
| 44373.239583333336 | 24.32 |
| 44373.25 | 24.314 |
| 44373.260416666664 | 24.307 |
| 44373.270833333336 | 24.367 |
| 44373.28125 | 24.473 |
| 44373.291666666664 | 24.549 |
| 44373.302083333336 | 24.629 |
| 44373.3125 | 24.684 |
| 44373.322916666664 | 24.733 |
| 44373.333333333336 | 24.767 |
| 44373.34375 | 24.825 |
| 44373.354166666664 | 24.842 |
| 44373.364583333336 | 24.869 |
| 44373.375 | 24.857 |
| 44373.385416666664 | 24.81 |
| 44373.395833333336 | 24.812 |
| 44373.40625 | 24.789 |
| 44373.416666666664 | 24.774 |
| 44373.427083333336 | 24.688 |
| 44373.4375 | 24.581 |
| 44373.447916666664 | 24.49 |
| 44373.458333333336 | 24.37 |
| 44373.46875 | 24.278 |
| 44373.479166666664 | 24.208 |
| 44373.489583333336 | 24.114 |
| 44373.5 | 23.986 |
| 44373.510416666664 | 23.957 |
| 44373.520833333336 | 23.936 |
| 44373.53125 | 23.876 |
| 44373.541666666664 | 23.795 |
| 44373.552083333336 | 23.766 |
| 44373.5625 | 23.769 |
| 44373.572916666664 | 23.804 |
| 44373.583333333336 | 23.8 |
| 44373.59375 | 23.888 |
| 44373.604166666664 | 23.944 |
| 44373.614583333336 | 23.996 |
| 44373.625 | 24.174 |
| 44373.635416666664 | 24.345 |
| 44373.645833333336 | 24.755 |
| 44373.65625 | 25.155 |
| 44373.666666666664 | 25.654 |
| 44373.677083333336 | 25.94 |
| 44373.6875 | 26.518 |
| 44373.697916666664 | 27.324 |
| 44373.708333333336 | 27.466 |
| 44373.71875 | 27.449 |
| 44373.729166666664 | 27.48 |
| 44373.739583333336 | 27.255 |
| 44373.75 | 27.454 |
| 44373.760416666664 | 27.614 |
| 44373.770833333336 | 27.87 |
| 44373.78125 | 27.962 |
| 44373.791666666664 | 28.038 |
| 44373.802083333336 | 28.159 |
| 44373.8125 | 28.348 |
| 44373.822916666664 | 28.471 |
| 44373.833333333336 | 28.545 |
| 44373.84375 | 28.632 |
| 44373.854166666664 | 28.777 |
| 44373.864583333336 | 28.812 |
| 44373.875 | 28.748 |
| 44373.885416666664 | 28.652 |
| 44373.895833333336 | 28.533 |
| 44373.90625 | 28.369 |
| 44373.916666666664 | 28.186 |
| 44373.927083333336 | 27.929 |
| 44373.9375 | 27.69 |
| 44373.947916666664 | 27.574 |
| 44373.958333333336 | 27.451 |
| 44373.96875 | 27.35 |
| 44373.979166666664 | 27.272 |
| 44373.989583333336 | 27.177 |
| 44374.0 | 27.076 |
| 44374.010416666664 | 27.007 |
| 44374.020833333336 | 26.783 |
| 44374.03125 | 26.639 |
| 44374.041666666664 | 26.258 |
| 44374.052083333336 | 26.127 |
| 44374.0625 | 26.16 |
| 44374.072916666664 | 26.119 |
| 44374.083333333336 | 26.107 |
| 44374.09375 | 26.137 |
| 44374.104166666664 | 26.122 |
| 44374.114583333336 | 26.046 |
| 44374.125 | 25.866 |
| 44374.135416666664 | 25.873 |
| 44374.145833333336 | 25.822 |
| 44374.15625 | 25.862 |
| 44374.166666666664 | 26.062 |
| 44374.177083333336 | 26.014 |
| 44374.1875 | 25.731 |
| 44374.197916666664 | 25.655 |
| 44374.208333333336 | 25.588 |
| 44374.21875 | 25.568 |
| 44374.229166666664 | 25.54 |
| 44374.239583333336 | 25.535 |
| 44374.25 | 25.536 |
| 44374.260416666664 | 25.515 |
| 44374.270833333336 | 25.627 |
| 44374.28125 | 25.518 |
| 44374.291666666664 | 25.556 |
| 44374.302083333336 | 25.667 |
| 44374.3125 | 25.718 |
| 44374.322916666664 | 25.79 |
| 44374.333333333336 | 25.93 |
| 44374.34375 | 25.976 |
| 44374.354166666664 | 26.029 |
| 44374.364583333336 | 26.076 |
| 44374.375 | 26.088 |
| 44374.385416666664 | 26.099 |
| 44374.395833333336 | 26.122 |
| 44374.40625 | 26.122 |
| 44374.416666666664 | 26.039 |
| 44374.427083333336 | 26.027 |
| 44374.4375 | 26.05 |
| 44374.447916666664 | 26.044 |
| 44374.458333333336 | 25.987 |
| 44374.46875 | 25.894 |
| 44374.479166666664 | 25.785 |
| 44374.489583333336 | 25.68 |
| 44374.5 | 25.605 |
| 44374.510416666664 | 25.551 |
| 44374.520833333336 | 25.514 |
| 44374.53125 | 25.477 |
| 44374.541666666664 | 25.426 |
| 44374.552083333336 | 25.414 |
| 44374.5625 | 25.386 |
| 44374.572916666664 | 25.386 |
| 44374.583333333336 | 25.409 |
| 44374.59375 | 25.402 |
| 44374.604166666664 | 25.421 |
| 44374.614583333336 | 25.443 |
| 44374.625 | 25.482 |
| 44374.635416666664 | 25.596 |
| 44374.645833333336 | 25.685 |
| 44374.65625 | 25.813 |
| 44374.666666666664 | 26.016 |
| 44374.677083333336 | 26.32 |
| 44374.6875 | 26.797 |
| 44374.697916666664 | 27.387 |
| 44374.708333333336 | 28.055 |
| 44374.71875 | 28.859 |
| 44374.729166666664 | 29.352 |
| 44374.739583333336 | 29.654 |
| 44374.75 | 29.892 |
| 44374.760416666664 | 29.505 |
| 44374.770833333336 | 29.062 |
| 44374.78125 | 29.333 |
| 44374.791666666664 | 29.639 |
| 44374.802083333336 | 29.819 |
| 44374.8125 | 30.024 |
| 44374.822916666664 | 30.203 |
| 44374.833333333336 | 30.258 |
| 44374.84375 | 30.458 |
| 44374.854166666664 | 30.503 |
| 44374.864583333336 | 30.51 |
| 44374.875 | 30.656 |
| 44374.885416666664 | 30.586 |
| 44374.895833333336 | 30.548 |
| 44374.90625 | 30.539 |
| 44374.916666666664 | 30.517 |
| 44374.927083333336 | 30.337 |
| 44374.9375 | 30.192 |
| 44374.947916666664 | 30.055 |
| 44374.958333333336 | 29.901 |
| 44374.96875 | 29.638 |
| 44374.979166666664 | 29.393 |
| 44374.989583333336 | 29.173 |
| 44375.0 | 29.007 |
| 44375.010416666664 | 28.888 |
| 44375.020833333336 | 28.751 |
| 44375.03125 | 28.603 |
| 44375.041666666664 | 28.506 |
| 44375.052083333336 | 28.391 |
| 44375.0625 | 28.272 |
| 44375.072916666664 | 28.022 |
| 44375.083333333336 | 27.88 |
| 44375.09375 | 27.636 |
| 44375.104166666664 | 27.486 |
| 44375.114583333336 | 27.42 |
| 44375.125 | 27.451 |
| 44375.135416666664 | 27.475 |
| 44375.145833333336 | 27.474 |
| 44375.15625 | 27.485 |
| 44375.166666666664 | 27.409 |
| 44375.177083333336 | 27.389 |
| 44375.1875 | 27.503 |
| 44375.197916666664 | 27.552 |
| 44375.208333333336 | 27.394 |
| 44375.21875 | 27.121 |
| 44375.229166666664 | 27.014 |
| 44375.239583333336 | 26.918 |
| 44375.25 | 26.904 |
| 44375.260416666664 | 26.827 |
| 44375.270833333336 | 26.891 |
| 44375.28125 | 26.724 |
| 44375.291666666664 | 26.642 |
| 44375.302083333336 | 26.718 |
| 44375.3125 | 26.798 |
| 44375.322916666664 | 26.836 |
| 44375.333333333336 | 26.838 |
| 44375.34375 | 26.9 |
| 44375.354166666664 | 26.911 |
| 44375.364583333336 | 27.019 |
| 44375.375 | 27.113 |
| 44375.385416666664 | 27.256 |
| 44375.395833333336 | 27.241 |
| 44375.40625 | 27.17 |
| 44375.416666666664 | 27.203 |
| 44375.427083333336 | 27.225 |
| 44375.4375 | 27.168 |
| 44375.447916666664 | 27.175 |
| 44375.458333333336 | 27.123 |
| 44375.46875 | 27.204 |
| 44375.479166666664 | 27.226 |
| 44375.489583333336 | 27.204 |
| 44375.5 | 27.118 |
| 44375.510416666664 | 27.007 |
| 44375.520833333336 | 26.956 |
| 44375.53125 | 26.897 |
| 44375.541666666664 | 26.842 |
| 44375.552083333336 | 26.837 |
| 44375.5625 | 26.799 |
| 44375.572916666664 | 26.79 |
| 44375.583333333336 | 26.807 |
| 44375.59375 | 26.836 |
| 44375.604166666664 | 26.874 |
| 44375.614583333336 | 26.942 |
| 44375.625 | 27.017 |
| 44375.635416666664 | 27.034 |
| 44375.645833333336 | 27.067 |
| 44375.65625 | 27.117 |
| 44375.666666666664 | 27.183 |
| 44375.677083333336 | 27.256 |
| 44375.6875 | 27.334 |
| 44375.697916666664 | 27.571 |
| 44375.708333333336 | 27.834 |
| 44375.71875 | 28.078 |
| 44375.729166666664 | 28.787 |
| 44375.739583333336 | 29.388 |
| 44375.75 | 30.343 |
| 44375.760416666664 | 30.509 |
| 44375.770833333336 | 30.895 |
| 44375.78125 | 31.287 |
| 44375.791666666664 | 30.842 |
| 44375.802083333336 | 30.226 |
| 44375.8125 | 30.373 |
| 44375.822916666664 | 30.758 |
| 44375.833333333336 | 30.854 |
| 44375.84375 | 31.112 |
| 44375.854166666664 | 31.167 |
| 44375.864583333336 | 31.317 |
| 44375.875 | 31.507 |
| 44375.885416666664 | 31.447 |
| 44375.895833333336 | 31.576 |
| 44375.90625 | 31.561 |
| 44375.916666666664 | 31.438 |
| 44375.927083333336 | 31.355 |
| 44375.9375 | 31.301 |
| 44375.947916666664 | 31.243 |
| 44375.958333333336 | 31.187 |
| 44375.96875 | 31.094 |
| 44375.979166666664 | 30.976 |
| 44375.989583333336 | 30.832 |
| 44376.0 | 30.677 |
| 44376.010416666664 | 30.406 |
| 44376.020833333336 | 30.093 |
| 44376.03125 | 29.777 |
| 44376.041666666664 | 29.545 |
| 44376.052083333336 | 29.396 |
| 44376.0625 | 29.288 |
| 44376.072916666664 | 29.154 |
| 44376.083333333336 | 29.066 |
| 44376.09375 | 28.943 |
| 44376.104166666664 | 28.869 |
| 44376.114583333336 | 28.781 |
| 44376.125 | 28.549 |
| 44376.135416666664 | 28.444 |
| 44376.145833333336 | 28.226 |
| 44376.15625 | 28.145 |
| 44376.166666666664 | 28.165 |
| 44376.177083333336 | 28.143 |
| 44376.1875 | 28.137 |
| 44376.197916666664 | 28.146 |
| 44376.208333333336 | 28.155 |
| 44376.21875 | 28.168 |
| 44376.229166666664 | 28.348 |
| 44376.239583333336 | 28.261 |
| 44376.25 | 28.08 |
| 44376.260416666664 | 27.975 |
| 44376.270833333336 | 27.732 |
| 44376.28125 | 27.558 |
| 44376.291666666664 | 27.665 |
| 44376.302083333336 | 27.55 |
| 44376.3125 | 27.428 |
| 44376.322916666664 | 27.381 |
| 44376.333333333336 | 27.61 |
| 44376.34375 | 27.592 |
| 44376.354166666664 | 27.794 |
| 44376.364583333336 | 27.751 |
| 44376.375 | 27.881 |
| 44376.385416666664 | 27.921 |
| 44376.395833333336 | 28.007 |
| 44376.40625 | 28.024 |
| 44376.416666666664 | 27.969 |
| 44376.427083333336 | 28.01 |
| 44376.4375 | 27.975 |
| 44376.447916666664 | 28.013 |
| 44376.458333333336 | 27.99 |
| 44376.46875 | 27.943 |
| 44376.479166666664 | 27.972 |
| 44376.489583333336 | 27.954 |
| 44376.5 | 28.015 |
| 44376.510416666664 | 28.076 |
| 44376.520833333336 | 28.098 |
| 44376.53125 | 28.076 |
| 44376.541666666664 | 28.014 |
| 44376.552083333336 | 27.942 |
| 44376.5625 | 27.944 |
| 44376.572916666664 | 27.919 |
| 44376.583333333336 | 27.927 |
| 44376.59375 | 27.924 |
| 44376.604166666664 | 27.927 |
| 44376.614583333336 | 27.943 |
| 44376.625 | 28.005 |
| 44376.635416666664 | 28.079 |
| 44376.645833333336 | 28.144 |
| 44376.65625 | 28.209 |
| 44376.666666666664 | 28.265 |
| 44376.677083333336 | 28.307 |
| 44376.6875 | 28.349 |
| 44376.697916666664 | 28.374 |
| 44376.708333333336 | 28.483 |
| 44376.71875 | 28.529 |
| 44376.729166666664 | 28.617 |
| 44376.739583333336 | 28.695 |
| 44376.75 | 28.924 |
| 44376.760416666664 | 30.04 |
| 44376.770833333336 | 30.416 |
| 44376.78125 | 31.619 |
| 44376.791666666664 | 31.22 |
| 44376.802083333336 | 32.124 |
| 44376.8125 | 32.036 |
| 44376.822916666664 | 31.453 |
| 44376.833333333336 | 31.454 |
| 44376.84375 | 31.305 |
| 44376.854166666664 | 31.632 |
| 44376.864583333336 | 31.755 |
| 44376.875 | 31.834 |
| 44376.885416666664 | 31.987 |
| 44376.895833333336 | 32.027 |
| 44376.90625 | 32.025 |
| 44376.916666666664 | 32.115 |
| 44376.927083333336 | 32.178 |
| 44376.9375 | 32.042 |
| 44376.947916666664 | 31.93 |
| 44376.958333333336 | 31.885 |
| 44376.96875 | 31.865 |
| 44376.979166666664 | 31.808 |
| 44376.989583333336 | 31.764 |
| 44377.0 | 31.687 |
| 44377.010416666664 | 31.669 |
| 44377.020833333336 | 31.603 |
| 44377.03125 | 31.415 |
| 44377.041666666664 | 31.182 |
| 44377.052083333336 | 30.681 |
| 44377.0625 | 30.091 |
| 44377.072916666664 | 29.81 |
| 44377.083333333336 | 29.624 |
| 44377.09375 | 29.521 |
| 44377.104166666664 | 29.449 |
| 44377.114583333336 | 29.373 |
| 44377.125 | 29.266 |
| 44377.135416666664 | 29.154 |
| 44377.145833333336 | 29.107 |
| 44377.15625 | 29.036 |
| 44377.166666666664 | 28.934 |
| 44377.177083333336 | 28.881 |
| 44377.1875 | 28.844 |
| 44377.197916666664 | 28.82 |
| 44377.208333333336 | 28.802 |
| 44377.21875 | 28.794 |
| 44377.229166666664 | 28.783 |
| 44377.239583333336 | 28.773 |
| 44377.25 | 28.92 |
| 44377.260416666664 | 28.813 |
| 44377.270833333336 | 28.769 |
| 44377.28125 | 28.626 |
| 44377.291666666664 | 28.531 |
| 44377.302083333336 | 28.324 |
| 44377.3125 | 28.286 |
| 44377.322916666664 | 28.28 |
| 44377.333333333336 | 28.154 |
| 44377.34375 | 28.014 |
| 44377.354166666664 | 28.179 |
| 44377.364583333336 | 28.259 |
| 44377.375 | 28.357 |
| 44377.385416666664 | 28.417 |
| 44377.395833333336 | 28.457 |
| 44377.40625 | 28.461 |
| 44377.416666666664 | 28.492 |
| 44377.427083333336 | 28.505 |
| 44377.4375 | 28.495 |
| 44377.447916666664 | 28.505 |
| 44377.458333333336 | 28.464 |
| 44377.46875 | 28.473 |
| 44377.479166666664 | 28.482 |
| 44377.489583333336 | 28.493 |
| 44377.5 | 28.509 |
| 44377.510416666664 | 28.522 |
| 44377.520833333336 | 28.507 |
| 44377.53125 | 28.559 |
| 44377.541666666664 | 28.605 |
| 44377.552083333336 | 28.623 |
| 44377.5625 | 28.616 |
| 44377.572916666664 | 28.496 |
| 44377.583333333336 | 28.459 |
| 44377.59375 | 28.5 |
| 44377.604166666664 | 28.546 |
| 44377.614583333336 | 28.597 |
| 44377.625 | 28.671 |
| 44377.635416666664 | 28.738 |
| 44377.645833333336 | 28.808 |
| 44377.65625 | 28.892 |
| 44377.666666666664 | 28.999 |
| 44377.677083333336 | 29.076 |
| 44377.6875 | 29.147 |
| 44377.697916666664 | 29.177 |
| 44377.708333333336 | 29.204 |
| 44377.71875 | 29.239 |
| 44377.729166666664 | 29.279 |
| 44377.739583333336 | 29.327 |
| 44377.75 | 29.392 |
| 44377.760416666664 | 29.456 |
| 44377.770833333336 | 29.612 |
| 44377.78125 | 29.853 |
| 44377.791666666664 | 29.98 |
| 44377.802083333336 | 30.208 |
| 44377.8125 | 30.397 |
| 44377.822916666664 | 30.371 |
| 44377.833333333336 | 31.322 |
| 44377.84375 | 32.114 |
| 44377.854166666664 | 31.774 |
| 44377.864583333336 | 32.527 |
| 44377.875 | 32.642 |
| 44377.885416666664 | 32.084 |
| 44377.895833333336 | 31.668 |
| 44377.90625 | 31.773 |
| 44377.916666666664 | 31.916 |
| 44377.927083333336 | 31.947 |
| 44377.9375 | 32.104 |
| 44377.947916666664 | 32.137 |
| 44377.958333333336 | 32.041 |
| 44377.96875 | 32.02 |
| 44377.979166666664 | 31.984 |
| 44377.989583333336 | 31.947 |
| 44378.0 | 31.886 |
| 44378.010416666664 | 31.862 |
| 44378.020833333336 | 31.827 |
| 44378.03125 | 31.762 |
| 44378.041666666664 | 31.743 |
| 44378.052083333336 | 31.738 |
| 44378.0625 | 31.704 |
| 44378.072916666664 | 31.493 |
| 44378.083333333336 | 31.226 |
| 44378.09375 | 30.899 |
| 44378.104166666664 | 30.544 |
| 44378.114583333336 | 30.269 |
| 44378.125 | 30.07 |
| 44378.135416666664 | 29.902 |
| 44378.145833333336 | 29.76 |
| 44378.15625 | 29.662 |